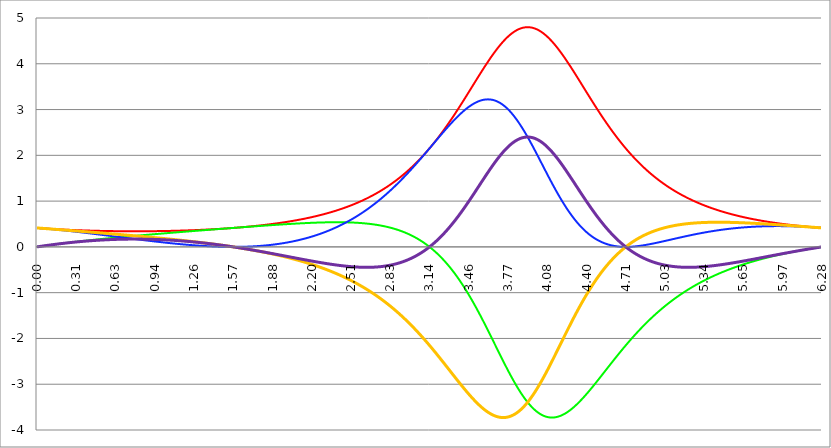
| Category | Series 1 | Series 0 | Series 2 | Series 3 | Series 4 |
|---|---|---|---|---|---|
| 0.0 | 0.414 | 0 | 0.414 | 0.414 | 0 |
| 0.00314159265358979 | 0.413 | 0.001 | 0.413 | 0.413 | 0.001 |
| 0.00628318530717958 | 0.413 | 0.003 | 0.413 | 0.413 | 0.003 |
| 0.00942477796076938 | 0.412 | 0.004 | 0.412 | 0.412 | 0.004 |
| 0.0125663706143592 | 0.412 | 0.005 | 0.411 | 0.411 | 0.005 |
| 0.015707963267949 | 0.411 | 0.006 | 0.411 | 0.411 | 0.006 |
| 0.0188495559215388 | 0.41 | 0.008 | 0.41 | 0.41 | 0.008 |
| 0.0219911485751285 | 0.41 | 0.009 | 0.409 | 0.41 | 0.009 |
| 0.0251327412287183 | 0.409 | 0.01 | 0.409 | 0.409 | 0.01 |
| 0.0282743338823081 | 0.408 | 0.012 | 0.408 | 0.408 | 0.012 |
| 0.0314159265358979 | 0.408 | 0.013 | 0.407 | 0.408 | 0.013 |
| 0.0345575191894877 | 0.407 | 0.014 | 0.407 | 0.407 | 0.014 |
| 0.0376991118430775 | 0.407 | 0.015 | 0.406 | 0.406 | 0.015 |
| 0.0408407044966673 | 0.406 | 0.017 | 0.405 | 0.406 | 0.017 |
| 0.0439822971502571 | 0.405 | 0.018 | 0.405 | 0.405 | 0.018 |
| 0.0471238898038469 | 0.405 | 0.019 | 0.404 | 0.404 | 0.019 |
| 0.0502654824574367 | 0.404 | 0.02 | 0.403 | 0.404 | 0.02 |
| 0.0534070751110265 | 0.404 | 0.022 | 0.402 | 0.403 | 0.022 |
| 0.0565486677646163 | 0.403 | 0.023 | 0.402 | 0.402 | 0.023 |
| 0.059690260418206 | 0.402 | 0.024 | 0.401 | 0.402 | 0.024 |
| 0.0628318530717958 | 0.402 | 0.025 | 0.4 | 0.401 | 0.025 |
| 0.0659734457253856 | 0.401 | 0.026 | 0.399 | 0.4 | 0.026 |
| 0.0691150383789754 | 0.401 | 0.028 | 0.399 | 0.4 | 0.028 |
| 0.0722566310325652 | 0.4 | 0.029 | 0.398 | 0.399 | 0.029 |
| 0.075398223686155 | 0.4 | 0.03 | 0.397 | 0.398 | 0.03 |
| 0.0785398163397448 | 0.399 | 0.031 | 0.397 | 0.398 | 0.031 |
| 0.0816814089933346 | 0.398 | 0.033 | 0.396 | 0.397 | 0.032 |
| 0.0848230016469244 | 0.398 | 0.034 | 0.395 | 0.396 | 0.034 |
| 0.0879645943005142 | 0.397 | 0.035 | 0.394 | 0.396 | 0.035 |
| 0.091106186954104 | 0.397 | 0.036 | 0.393 | 0.395 | 0.036 |
| 0.0942477796076937 | 0.396 | 0.037 | 0.393 | 0.394 | 0.037 |
| 0.0973893722612835 | 0.396 | 0.038 | 0.392 | 0.394 | 0.038 |
| 0.100530964914873 | 0.395 | 0.04 | 0.391 | 0.393 | 0.039 |
| 0.103672557568463 | 0.395 | 0.041 | 0.39 | 0.392 | 0.041 |
| 0.106814150222053 | 0.394 | 0.042 | 0.39 | 0.392 | 0.042 |
| 0.109955742875643 | 0.394 | 0.043 | 0.389 | 0.391 | 0.043 |
| 0.113097335529233 | 0.393 | 0.044 | 0.388 | 0.39 | 0.044 |
| 0.116238928182822 | 0.392 | 0.046 | 0.387 | 0.39 | 0.045 |
| 0.119380520836412 | 0.392 | 0.047 | 0.386 | 0.389 | 0.046 |
| 0.122522113490002 | 0.391 | 0.048 | 0.386 | 0.388 | 0.047 |
| 0.125663706143592 | 0.391 | 0.049 | 0.385 | 0.388 | 0.049 |
| 0.128805298797181 | 0.39 | 0.05 | 0.384 | 0.387 | 0.05 |
| 0.131946891450771 | 0.39 | 0.051 | 0.383 | 0.387 | 0.051 |
| 0.135088484104361 | 0.389 | 0.052 | 0.382 | 0.386 | 0.052 |
| 0.138230076757951 | 0.389 | 0.054 | 0.382 | 0.385 | 0.053 |
| 0.141371669411541 | 0.388 | 0.055 | 0.381 | 0.385 | 0.054 |
| 0.14451326206513 | 0.388 | 0.056 | 0.38 | 0.384 | 0.055 |
| 0.14765485471872 | 0.387 | 0.057 | 0.379 | 0.383 | 0.056 |
| 0.15079644737231 | 0.387 | 0.058 | 0.378 | 0.383 | 0.057 |
| 0.1539380400259 | 0.386 | 0.059 | 0.377 | 0.382 | 0.059 |
| 0.15707963267949 | 0.386 | 0.06 | 0.376 | 0.381 | 0.06 |
| 0.160221225333079 | 0.385 | 0.061 | 0.376 | 0.381 | 0.061 |
| 0.163362817986669 | 0.385 | 0.063 | 0.375 | 0.38 | 0.062 |
| 0.166504410640259 | 0.385 | 0.064 | 0.374 | 0.379 | 0.063 |
| 0.169646003293849 | 0.384 | 0.065 | 0.373 | 0.379 | 0.064 |
| 0.172787595947439 | 0.384 | 0.066 | 0.372 | 0.378 | 0.065 |
| 0.175929188601028 | 0.383 | 0.067 | 0.371 | 0.377 | 0.066 |
| 0.179070781254618 | 0.383 | 0.068 | 0.371 | 0.377 | 0.067 |
| 0.182212373908208 | 0.382 | 0.069 | 0.37 | 0.376 | 0.068 |
| 0.185353966561798 | 0.382 | 0.07 | 0.369 | 0.375 | 0.069 |
| 0.188495559215388 | 0.381 | 0.071 | 0.368 | 0.375 | 0.07 |
| 0.191637151868977 | 0.381 | 0.073 | 0.367 | 0.374 | 0.071 |
| 0.194778744522567 | 0.38 | 0.074 | 0.366 | 0.373 | 0.072 |
| 0.197920337176157 | 0.38 | 0.075 | 0.365 | 0.373 | 0.073 |
| 0.201061929829747 | 0.38 | 0.076 | 0.364 | 0.372 | 0.074 |
| 0.204203522483336 | 0.379 | 0.077 | 0.363 | 0.371 | 0.075 |
| 0.207345115136926 | 0.379 | 0.078 | 0.363 | 0.371 | 0.076 |
| 0.210486707790516 | 0.378 | 0.079 | 0.362 | 0.37 | 0.077 |
| 0.213628300444106 | 0.378 | 0.08 | 0.361 | 0.369 | 0.078 |
| 0.216769893097696 | 0.377 | 0.081 | 0.36 | 0.369 | 0.079 |
| 0.219911485751285 | 0.377 | 0.082 | 0.359 | 0.368 | 0.08 |
| 0.223053078404875 | 0.377 | 0.083 | 0.358 | 0.367 | 0.081 |
| 0.226194671058465 | 0.376 | 0.084 | 0.357 | 0.367 | 0.082 |
| 0.229336263712055 | 0.376 | 0.085 | 0.356 | 0.366 | 0.083 |
| 0.232477856365645 | 0.375 | 0.086 | 0.355 | 0.365 | 0.084 |
| 0.235619449019234 | 0.375 | 0.088 | 0.354 | 0.364 | 0.085 |
| 0.238761041672824 | 0.374 | 0.089 | 0.354 | 0.364 | 0.086 |
| 0.241902634326414 | 0.374 | 0.09 | 0.353 | 0.363 | 0.087 |
| 0.245044226980004 | 0.374 | 0.091 | 0.352 | 0.362 | 0.088 |
| 0.248185819633594 | 0.373 | 0.092 | 0.351 | 0.362 | 0.089 |
| 0.251327412287183 | 0.373 | 0.093 | 0.35 | 0.361 | 0.09 |
| 0.254469004940773 | 0.372 | 0.094 | 0.349 | 0.36 | 0.091 |
| 0.257610597594363 | 0.372 | 0.095 | 0.348 | 0.36 | 0.092 |
| 0.260752190247953 | 0.372 | 0.096 | 0.347 | 0.359 | 0.093 |
| 0.263893782901543 | 0.371 | 0.097 | 0.346 | 0.358 | 0.093 |
| 0.267035375555132 | 0.371 | 0.098 | 0.345 | 0.358 | 0.094 |
| 0.270176968208722 | 0.371 | 0.099 | 0.344 | 0.357 | 0.095 |
| 0.273318560862312 | 0.37 | 0.1 | 0.343 | 0.356 | 0.096 |
| 0.276460153515902 | 0.37 | 0.101 | 0.342 | 0.356 | 0.097 |
| 0.279601746169492 | 0.369 | 0.102 | 0.341 | 0.355 | 0.098 |
| 0.282743338823082 | 0.369 | 0.103 | 0.34 | 0.354 | 0.099 |
| 0.285884931476671 | 0.369 | 0.104 | 0.339 | 0.354 | 0.1 |
| 0.289026524130261 | 0.368 | 0.105 | 0.338 | 0.353 | 0.101 |
| 0.292168116783851 | 0.368 | 0.106 | 0.337 | 0.352 | 0.101 |
| 0.295309709437441 | 0.368 | 0.107 | 0.336 | 0.352 | 0.102 |
| 0.298451302091031 | 0.367 | 0.108 | 0.336 | 0.351 | 0.103 |
| 0.30159289474462 | 0.367 | 0.109 | 0.335 | 0.35 | 0.104 |
| 0.30473448739821 | 0.367 | 0.11 | 0.334 | 0.35 | 0.105 |
| 0.3078760800518 | 0.366 | 0.111 | 0.333 | 0.349 | 0.106 |
| 0.31101767270539 | 0.366 | 0.112 | 0.332 | 0.348 | 0.107 |
| 0.31415926535898 | 0.366 | 0.113 | 0.331 | 0.348 | 0.107 |
| 0.31730085801257 | 0.365 | 0.114 | 0.33 | 0.347 | 0.108 |
| 0.320442450666159 | 0.365 | 0.115 | 0.329 | 0.346 | 0.109 |
| 0.323584043319749 | 0.365 | 0.116 | 0.328 | 0.346 | 0.11 |
| 0.326725635973339 | 0.364 | 0.117 | 0.327 | 0.345 | 0.111 |
| 0.329867228626929 | 0.364 | 0.118 | 0.326 | 0.344 | 0.112 |
| 0.333008821280519 | 0.364 | 0.119 | 0.325 | 0.344 | 0.112 |
| 0.336150413934108 | 0.363 | 0.12 | 0.324 | 0.343 | 0.113 |
| 0.339292006587698 | 0.363 | 0.121 | 0.323 | 0.342 | 0.114 |
| 0.342433599241288 | 0.363 | 0.122 | 0.322 | 0.342 | 0.115 |
| 0.345575191894878 | 0.362 | 0.123 | 0.321 | 0.341 | 0.115 |
| 0.348716784548468 | 0.362 | 0.124 | 0.32 | 0.34 | 0.116 |
| 0.351858377202058 | 0.362 | 0.125 | 0.319 | 0.339 | 0.117 |
| 0.354999969855647 | 0.361 | 0.126 | 0.318 | 0.339 | 0.118 |
| 0.358141562509237 | 0.361 | 0.127 | 0.317 | 0.338 | 0.119 |
| 0.361283155162827 | 0.361 | 0.128 | 0.316 | 0.337 | 0.119 |
| 0.364424747816417 | 0.36 | 0.128 | 0.315 | 0.337 | 0.12 |
| 0.367566340470007 | 0.36 | 0.129 | 0.314 | 0.336 | 0.121 |
| 0.370707933123597 | 0.36 | 0.13 | 0.313 | 0.335 | 0.122 |
| 0.373849525777186 | 0.36 | 0.131 | 0.312 | 0.335 | 0.122 |
| 0.376991118430776 | 0.359 | 0.132 | 0.311 | 0.334 | 0.123 |
| 0.380132711084366 | 0.359 | 0.133 | 0.31 | 0.333 | 0.124 |
| 0.383274303737956 | 0.359 | 0.134 | 0.309 | 0.333 | 0.124 |
| 0.386415896391546 | 0.358 | 0.135 | 0.308 | 0.332 | 0.125 |
| 0.389557489045135 | 0.358 | 0.136 | 0.306 | 0.331 | 0.126 |
| 0.392699081698725 | 0.358 | 0.137 | 0.305 | 0.331 | 0.127 |
| 0.395840674352315 | 0.358 | 0.138 | 0.304 | 0.33 | 0.127 |
| 0.398982267005905 | 0.357 | 0.139 | 0.303 | 0.329 | 0.128 |
| 0.402123859659495 | 0.357 | 0.14 | 0.302 | 0.329 | 0.129 |
| 0.405265452313085 | 0.357 | 0.141 | 0.301 | 0.328 | 0.129 |
| 0.408407044966674 | 0.357 | 0.142 | 0.3 | 0.327 | 0.13 |
| 0.411548637620264 | 0.356 | 0.143 | 0.299 | 0.326 | 0.131 |
| 0.414690230273854 | 0.356 | 0.143 | 0.298 | 0.326 | 0.131 |
| 0.417831822927444 | 0.356 | 0.144 | 0.297 | 0.325 | 0.132 |
| 0.420973415581034 | 0.355 | 0.145 | 0.296 | 0.324 | 0.133 |
| 0.424115008234623 | 0.355 | 0.146 | 0.295 | 0.324 | 0.133 |
| 0.427256600888213 | 0.355 | 0.147 | 0.294 | 0.323 | 0.134 |
| 0.430398193541803 | 0.355 | 0.148 | 0.293 | 0.322 | 0.135 |
| 0.433539786195393 | 0.354 | 0.149 | 0.292 | 0.322 | 0.135 |
| 0.436681378848983 | 0.354 | 0.15 | 0.291 | 0.321 | 0.136 |
| 0.439822971502573 | 0.354 | 0.151 | 0.29 | 0.32 | 0.136 |
| 0.442964564156162 | 0.354 | 0.152 | 0.289 | 0.32 | 0.137 |
| 0.446106156809752 | 0.354 | 0.153 | 0.288 | 0.319 | 0.138 |
| 0.449247749463342 | 0.353 | 0.153 | 0.287 | 0.318 | 0.138 |
| 0.452389342116932 | 0.353 | 0.154 | 0.286 | 0.318 | 0.139 |
| 0.455530934770522 | 0.353 | 0.155 | 0.285 | 0.317 | 0.139 |
| 0.458672527424111 | 0.353 | 0.156 | 0.283 | 0.316 | 0.14 |
| 0.461814120077701 | 0.352 | 0.157 | 0.282 | 0.315 | 0.141 |
| 0.464955712731291 | 0.352 | 0.158 | 0.281 | 0.315 | 0.141 |
| 0.468097305384881 | 0.352 | 0.159 | 0.28 | 0.314 | 0.142 |
| 0.471238898038471 | 0.352 | 0.16 | 0.279 | 0.313 | 0.142 |
| 0.474380490692061 | 0.351 | 0.161 | 0.278 | 0.313 | 0.143 |
| 0.47752208334565 | 0.351 | 0.161 | 0.277 | 0.312 | 0.143 |
| 0.48066367599924 | 0.351 | 0.162 | 0.276 | 0.311 | 0.144 |
| 0.48380526865283 | 0.351 | 0.163 | 0.275 | 0.311 | 0.144 |
| 0.48694686130642 | 0.351 | 0.164 | 0.274 | 0.31 | 0.145 |
| 0.49008845396001 | 0.35 | 0.165 | 0.273 | 0.309 | 0.146 |
| 0.493230046613599 | 0.35 | 0.166 | 0.272 | 0.308 | 0.146 |
| 0.496371639267189 | 0.35 | 0.167 | 0.271 | 0.308 | 0.147 |
| 0.499513231920779 | 0.35 | 0.168 | 0.27 | 0.307 | 0.147 |
| 0.502654824574369 | 0.35 | 0.168 | 0.269 | 0.306 | 0.148 |
| 0.505796417227959 | 0.349 | 0.169 | 0.267 | 0.306 | 0.148 |
| 0.508938009881549 | 0.349 | 0.17 | 0.266 | 0.305 | 0.149 |
| 0.512079602535138 | 0.349 | 0.171 | 0.265 | 0.304 | 0.149 |
| 0.515221195188728 | 0.349 | 0.172 | 0.264 | 0.304 | 0.15 |
| 0.518362787842318 | 0.349 | 0.173 | 0.263 | 0.303 | 0.15 |
| 0.521504380495908 | 0.349 | 0.174 | 0.262 | 0.302 | 0.151 |
| 0.524645973149498 | 0.348 | 0.174 | 0.261 | 0.302 | 0.151 |
| 0.527787565803087 | 0.348 | 0.175 | 0.26 | 0.301 | 0.151 |
| 0.530929158456677 | 0.348 | 0.176 | 0.259 | 0.3 | 0.152 |
| 0.534070751110267 | 0.348 | 0.177 | 0.258 | 0.299 | 0.152 |
| 0.537212343763857 | 0.348 | 0.178 | 0.257 | 0.299 | 0.153 |
| 0.540353936417447 | 0.347 | 0.179 | 0.256 | 0.298 | 0.153 |
| 0.543495529071037 | 0.347 | 0.18 | 0.254 | 0.297 | 0.154 |
| 0.546637121724626 | 0.347 | 0.18 | 0.253 | 0.297 | 0.154 |
| 0.549778714378216 | 0.347 | 0.181 | 0.252 | 0.296 | 0.155 |
| 0.552920307031806 | 0.347 | 0.182 | 0.251 | 0.295 | 0.155 |
| 0.556061899685396 | 0.347 | 0.183 | 0.25 | 0.294 | 0.155 |
| 0.559203492338986 | 0.347 | 0.184 | 0.249 | 0.294 | 0.156 |
| 0.562345084992576 | 0.346 | 0.185 | 0.248 | 0.293 | 0.156 |
| 0.565486677646165 | 0.346 | 0.186 | 0.247 | 0.292 | 0.157 |
| 0.568628270299755 | 0.346 | 0.186 | 0.246 | 0.292 | 0.157 |
| 0.571769862953345 | 0.346 | 0.187 | 0.245 | 0.291 | 0.157 |
| 0.574911455606935 | 0.346 | 0.188 | 0.244 | 0.29 | 0.158 |
| 0.578053048260525 | 0.346 | 0.189 | 0.242 | 0.289 | 0.158 |
| 0.581194640914114 | 0.346 | 0.19 | 0.241 | 0.289 | 0.159 |
| 0.584336233567704 | 0.345 | 0.191 | 0.24 | 0.288 | 0.159 |
| 0.587477826221294 | 0.345 | 0.191 | 0.239 | 0.287 | 0.159 |
| 0.590619418874884 | 0.345 | 0.192 | 0.238 | 0.287 | 0.16 |
| 0.593761011528474 | 0.345 | 0.193 | 0.237 | 0.286 | 0.16 |
| 0.596902604182064 | 0.345 | 0.194 | 0.236 | 0.285 | 0.16 |
| 0.600044196835653 | 0.345 | 0.195 | 0.235 | 0.285 | 0.161 |
| 0.603185789489243 | 0.345 | 0.195 | 0.234 | 0.284 | 0.161 |
| 0.606327382142833 | 0.344 | 0.196 | 0.233 | 0.283 | 0.161 |
| 0.609468974796423 | 0.344 | 0.197 | 0.232 | 0.282 | 0.162 |
| 0.612610567450013 | 0.344 | 0.198 | 0.23 | 0.282 | 0.162 |
| 0.615752160103602 | 0.344 | 0.199 | 0.229 | 0.281 | 0.162 |
| 0.618893752757192 | 0.344 | 0.2 | 0.228 | 0.28 | 0.163 |
| 0.622035345410782 | 0.344 | 0.2 | 0.227 | 0.279 | 0.163 |
| 0.625176938064372 | 0.344 | 0.201 | 0.226 | 0.279 | 0.163 |
| 0.628318530717962 | 0.344 | 0.202 | 0.225 | 0.278 | 0.163 |
| 0.631460123371551 | 0.344 | 0.203 | 0.224 | 0.277 | 0.164 |
| 0.634601716025141 | 0.343 | 0.204 | 0.223 | 0.277 | 0.164 |
| 0.637743308678731 | 0.343 | 0.204 | 0.222 | 0.276 | 0.164 |
| 0.640884901332321 | 0.343 | 0.205 | 0.221 | 0.275 | 0.165 |
| 0.644026493985911 | 0.343 | 0.206 | 0.219 | 0.274 | 0.165 |
| 0.647168086639501 | 0.343 | 0.207 | 0.218 | 0.274 | 0.165 |
| 0.65030967929309 | 0.343 | 0.208 | 0.217 | 0.273 | 0.165 |
| 0.65345127194668 | 0.343 | 0.208 | 0.216 | 0.272 | 0.166 |
| 0.65659286460027 | 0.343 | 0.209 | 0.215 | 0.272 | 0.166 |
| 0.65973445725386 | 0.343 | 0.21 | 0.214 | 0.271 | 0.166 |
| 0.66287604990745 | 0.343 | 0.211 | 0.213 | 0.27 | 0.166 |
| 0.666017642561039 | 0.343 | 0.212 | 0.212 | 0.269 | 0.166 |
| 0.669159235214629 | 0.342 | 0.212 | 0.211 | 0.269 | 0.167 |
| 0.672300827868219 | 0.342 | 0.213 | 0.21 | 0.268 | 0.167 |
| 0.675442420521809 | 0.342 | 0.214 | 0.209 | 0.267 | 0.167 |
| 0.678584013175399 | 0.342 | 0.215 | 0.207 | 0.266 | 0.167 |
| 0.681725605828989 | 0.342 | 0.216 | 0.206 | 0.266 | 0.167 |
| 0.684867198482578 | 0.342 | 0.216 | 0.205 | 0.265 | 0.168 |
| 0.688008791136168 | 0.342 | 0.217 | 0.204 | 0.264 | 0.168 |
| 0.691150383789758 | 0.342 | 0.218 | 0.203 | 0.264 | 0.168 |
| 0.694291976443348 | 0.342 | 0.219 | 0.202 | 0.263 | 0.168 |
| 0.697433569096938 | 0.342 | 0.22 | 0.201 | 0.262 | 0.168 |
| 0.700575161750528 | 0.342 | 0.22 | 0.2 | 0.261 | 0.168 |
| 0.703716754404117 | 0.342 | 0.221 | 0.199 | 0.261 | 0.169 |
| 0.706858347057707 | 0.342 | 0.222 | 0.198 | 0.26 | 0.169 |
| 0.709999939711297 | 0.342 | 0.223 | 0.196 | 0.259 | 0.169 |
| 0.713141532364887 | 0.342 | 0.223 | 0.195 | 0.258 | 0.169 |
| 0.716283125018477 | 0.342 | 0.224 | 0.194 | 0.258 | 0.169 |
| 0.719424717672066 | 0.342 | 0.225 | 0.193 | 0.257 | 0.169 |
| 0.722566310325656 | 0.341 | 0.226 | 0.192 | 0.256 | 0.169 |
| 0.725707902979246 | 0.341 | 0.227 | 0.191 | 0.255 | 0.17 |
| 0.728849495632836 | 0.341 | 0.227 | 0.19 | 0.255 | 0.17 |
| 0.731991088286426 | 0.341 | 0.228 | 0.189 | 0.254 | 0.17 |
| 0.735132680940016 | 0.341 | 0.229 | 0.188 | 0.253 | 0.17 |
| 0.738274273593605 | 0.341 | 0.23 | 0.187 | 0.252 | 0.17 |
| 0.741415866247195 | 0.341 | 0.23 | 0.186 | 0.252 | 0.17 |
| 0.744557458900785 | 0.341 | 0.231 | 0.185 | 0.251 | 0.17 |
| 0.747699051554375 | 0.341 | 0.232 | 0.183 | 0.25 | 0.17 |
| 0.750840644207965 | 0.341 | 0.233 | 0.182 | 0.249 | 0.17 |
| 0.753982236861554 | 0.341 | 0.234 | 0.181 | 0.249 | 0.17 |
| 0.757123829515144 | 0.341 | 0.234 | 0.18 | 0.248 | 0.17 |
| 0.760265422168734 | 0.341 | 0.235 | 0.179 | 0.247 | 0.17 |
| 0.763407014822324 | 0.341 | 0.236 | 0.178 | 0.246 | 0.17 |
| 0.766548607475914 | 0.341 | 0.237 | 0.177 | 0.246 | 0.17 |
| 0.769690200129504 | 0.341 | 0.237 | 0.176 | 0.245 | 0.17 |
| 0.772831792783093 | 0.341 | 0.238 | 0.175 | 0.244 | 0.17 |
| 0.775973385436683 | 0.341 | 0.239 | 0.174 | 0.243 | 0.171 |
| 0.779114978090273 | 0.341 | 0.24 | 0.173 | 0.243 | 0.171 |
| 0.782256570743863 | 0.341 | 0.24 | 0.172 | 0.242 | 0.171 |
| 0.785398163397453 | 0.341 | 0.241 | 0.171 | 0.241 | 0.171 |
| 0.788539756051042 | 0.341 | 0.242 | 0.169 | 0.24 | 0.171 |
| 0.791681348704632 | 0.341 | 0.243 | 0.168 | 0.24 | 0.171 |
| 0.794822941358222 | 0.341 | 0.243 | 0.167 | 0.239 | 0.171 |
| 0.797964534011812 | 0.341 | 0.244 | 0.166 | 0.238 | 0.17 |
| 0.801106126665402 | 0.341 | 0.245 | 0.165 | 0.237 | 0.17 |
| 0.804247719318992 | 0.341 | 0.246 | 0.164 | 0.237 | 0.17 |
| 0.807389311972581 | 0.341 | 0.246 | 0.163 | 0.236 | 0.17 |
| 0.810530904626171 | 0.341 | 0.247 | 0.162 | 0.235 | 0.17 |
| 0.813672497279761 | 0.341 | 0.248 | 0.161 | 0.234 | 0.17 |
| 0.816814089933351 | 0.341 | 0.249 | 0.16 | 0.234 | 0.17 |
| 0.819955682586941 | 0.341 | 0.249 | 0.159 | 0.233 | 0.17 |
| 0.823097275240531 | 0.341 | 0.25 | 0.158 | 0.232 | 0.17 |
| 0.82623886789412 | 0.341 | 0.251 | 0.157 | 0.231 | 0.17 |
| 0.82938046054771 | 0.341 | 0.252 | 0.156 | 0.23 | 0.17 |
| 0.8325220532013 | 0.341 | 0.252 | 0.155 | 0.23 | 0.17 |
| 0.83566364585489 | 0.341 | 0.253 | 0.154 | 0.229 | 0.17 |
| 0.83880523850848 | 0.341 | 0.254 | 0.152 | 0.228 | 0.17 |
| 0.841946831162069 | 0.341 | 0.255 | 0.151 | 0.227 | 0.17 |
| 0.845088423815659 | 0.341 | 0.255 | 0.15 | 0.227 | 0.17 |
| 0.848230016469249 | 0.341 | 0.256 | 0.149 | 0.226 | 0.169 |
| 0.851371609122839 | 0.342 | 0.257 | 0.148 | 0.225 | 0.169 |
| 0.854513201776429 | 0.342 | 0.258 | 0.147 | 0.224 | 0.169 |
| 0.857654794430019 | 0.342 | 0.258 | 0.146 | 0.223 | 0.169 |
| 0.860796387083608 | 0.342 | 0.259 | 0.145 | 0.223 | 0.169 |
| 0.863937979737198 | 0.342 | 0.26 | 0.144 | 0.222 | 0.169 |
| 0.867079572390788 | 0.342 | 0.261 | 0.143 | 0.221 | 0.169 |
| 0.870221165044378 | 0.342 | 0.261 | 0.142 | 0.22 | 0.168 |
| 0.873362757697968 | 0.342 | 0.262 | 0.141 | 0.22 | 0.168 |
| 0.876504350351557 | 0.342 | 0.263 | 0.14 | 0.219 | 0.168 |
| 0.879645943005147 | 0.342 | 0.264 | 0.139 | 0.218 | 0.168 |
| 0.882787535658737 | 0.342 | 0.264 | 0.138 | 0.217 | 0.168 |
| 0.885929128312327 | 0.342 | 0.265 | 0.137 | 0.216 | 0.168 |
| 0.889070720965917 | 0.342 | 0.266 | 0.136 | 0.216 | 0.167 |
| 0.892212313619507 | 0.342 | 0.266 | 0.135 | 0.215 | 0.167 |
| 0.895353906273096 | 0.342 | 0.267 | 0.134 | 0.214 | 0.167 |
| 0.898495498926686 | 0.342 | 0.268 | 0.133 | 0.213 | 0.167 |
| 0.901637091580276 | 0.342 | 0.269 | 0.132 | 0.212 | 0.167 |
| 0.904778684233866 | 0.343 | 0.269 | 0.131 | 0.212 | 0.166 |
| 0.907920276887456 | 0.343 | 0.27 | 0.13 | 0.211 | 0.166 |
| 0.911061869541045 | 0.343 | 0.271 | 0.129 | 0.21 | 0.166 |
| 0.914203462194635 | 0.343 | 0.272 | 0.128 | 0.209 | 0.166 |
| 0.917345054848225 | 0.343 | 0.272 | 0.127 | 0.208 | 0.166 |
| 0.920486647501815 | 0.343 | 0.273 | 0.126 | 0.208 | 0.165 |
| 0.923628240155405 | 0.343 | 0.274 | 0.125 | 0.207 | 0.165 |
| 0.926769832808995 | 0.343 | 0.274 | 0.124 | 0.206 | 0.165 |
| 0.929911425462584 | 0.343 | 0.275 | 0.123 | 0.205 | 0.165 |
| 0.933053018116174 | 0.343 | 0.276 | 0.122 | 0.204 | 0.164 |
| 0.936194610769764 | 0.343 | 0.277 | 0.121 | 0.204 | 0.164 |
| 0.939336203423354 | 0.344 | 0.277 | 0.12 | 0.203 | 0.164 |
| 0.942477796076944 | 0.344 | 0.278 | 0.119 | 0.202 | 0.163 |
| 0.945619388730533 | 0.344 | 0.279 | 0.118 | 0.201 | 0.163 |
| 0.948760981384123 | 0.344 | 0.279 | 0.117 | 0.2 | 0.163 |
| 0.951902574037713 | 0.344 | 0.28 | 0.116 | 0.2 | 0.163 |
| 0.955044166691303 | 0.344 | 0.281 | 0.115 | 0.199 | 0.162 |
| 0.958185759344893 | 0.344 | 0.282 | 0.114 | 0.198 | 0.162 |
| 0.961327351998483 | 0.344 | 0.282 | 0.113 | 0.197 | 0.162 |
| 0.964468944652072 | 0.344 | 0.283 | 0.112 | 0.196 | 0.161 |
| 0.967610537305662 | 0.345 | 0.284 | 0.111 | 0.195 | 0.161 |
| 0.970752129959252 | 0.345 | 0.285 | 0.11 | 0.195 | 0.161 |
| 0.973893722612842 | 0.345 | 0.285 | 0.109 | 0.194 | 0.16 |
| 0.977035315266432 | 0.345 | 0.286 | 0.108 | 0.193 | 0.16 |
| 0.980176907920022 | 0.345 | 0.287 | 0.107 | 0.192 | 0.16 |
| 0.983318500573611 | 0.345 | 0.287 | 0.106 | 0.191 | 0.159 |
| 0.986460093227201 | 0.345 | 0.288 | 0.105 | 0.191 | 0.159 |
| 0.989601685880791 | 0.346 | 0.289 | 0.104 | 0.19 | 0.159 |
| 0.992743278534381 | 0.346 | 0.289 | 0.103 | 0.189 | 0.158 |
| 0.995884871187971 | 0.346 | 0.29 | 0.102 | 0.188 | 0.158 |
| 0.99902646384156 | 0.346 | 0.291 | 0.101 | 0.187 | 0.157 |
| 1.00216805649515 | 0.346 | 0.292 | 0.1 | 0.186 | 0.157 |
| 1.00530964914874 | 0.346 | 0.292 | 0.099 | 0.186 | 0.157 |
| 1.00845124180233 | 0.346 | 0.293 | 0.098 | 0.185 | 0.156 |
| 1.01159283445592 | 0.347 | 0.294 | 0.098 | 0.184 | 0.156 |
| 1.01473442710951 | 0.347 | 0.294 | 0.097 | 0.183 | 0.155 |
| 1.017876019763099 | 0.347 | 0.295 | 0.096 | 0.182 | 0.155 |
| 1.021017612416689 | 0.347 | 0.296 | 0.095 | 0.181 | 0.155 |
| 1.02415920507028 | 0.347 | 0.297 | 0.094 | 0.18 | 0.154 |
| 1.027300797723869 | 0.347 | 0.297 | 0.093 | 0.18 | 0.154 |
| 1.030442390377459 | 0.347 | 0.298 | 0.092 | 0.179 | 0.153 |
| 1.033583983031048 | 0.348 | 0.299 | 0.091 | 0.178 | 0.153 |
| 1.036725575684638 | 0.348 | 0.299 | 0.09 | 0.177 | 0.152 |
| 1.039867168338228 | 0.348 | 0.3 | 0.089 | 0.176 | 0.152 |
| 1.043008760991818 | 0.348 | 0.301 | 0.088 | 0.175 | 0.151 |
| 1.046150353645408 | 0.348 | 0.302 | 0.087 | 0.174 | 0.151 |
| 1.049291946298998 | 0.349 | 0.302 | 0.087 | 0.174 | 0.151 |
| 1.052433538952587 | 0.349 | 0.303 | 0.086 | 0.173 | 0.15 |
| 1.055575131606177 | 0.349 | 0.304 | 0.085 | 0.172 | 0.15 |
| 1.058716724259767 | 0.349 | 0.304 | 0.084 | 0.171 | 0.149 |
| 1.061858316913357 | 0.349 | 0.305 | 0.083 | 0.17 | 0.149 |
| 1.064999909566947 | 0.349 | 0.306 | 0.082 | 0.169 | 0.148 |
| 1.068141502220536 | 0.35 | 0.306 | 0.081 | 0.168 | 0.148 |
| 1.071283094874126 | 0.35 | 0.307 | 0.08 | 0.168 | 0.147 |
| 1.074424687527716 | 0.35 | 0.308 | 0.079 | 0.167 | 0.147 |
| 1.077566280181306 | 0.35 | 0.308 | 0.079 | 0.166 | 0.146 |
| 1.080707872834896 | 0.35 | 0.309 | 0.078 | 0.165 | 0.146 |
| 1.083849465488486 | 0.351 | 0.31 | 0.077 | 0.164 | 0.145 |
| 1.086991058142075 | 0.351 | 0.311 | 0.076 | 0.163 | 0.144 |
| 1.090132650795665 | 0.351 | 0.311 | 0.075 | 0.162 | 0.144 |
| 1.093274243449255 | 0.351 | 0.312 | 0.074 | 0.161 | 0.143 |
| 1.096415836102845 | 0.351 | 0.313 | 0.073 | 0.161 | 0.143 |
| 1.099557428756435 | 0.352 | 0.313 | 0.072 | 0.16 | 0.142 |
| 1.102699021410025 | 0.352 | 0.314 | 0.072 | 0.159 | 0.142 |
| 1.105840614063614 | 0.352 | 0.315 | 0.071 | 0.158 | 0.141 |
| 1.108982206717204 | 0.352 | 0.315 | 0.07 | 0.157 | 0.141 |
| 1.112123799370794 | 0.353 | 0.316 | 0.069 | 0.156 | 0.14 |
| 1.115265392024384 | 0.353 | 0.317 | 0.068 | 0.155 | 0.139 |
| 1.118406984677974 | 0.353 | 0.318 | 0.067 | 0.154 | 0.139 |
| 1.121548577331563 | 0.353 | 0.318 | 0.067 | 0.153 | 0.138 |
| 1.124690169985153 | 0.354 | 0.319 | 0.066 | 0.153 | 0.138 |
| 1.127831762638743 | 0.354 | 0.32 | 0.065 | 0.152 | 0.137 |
| 1.130973355292333 | 0.354 | 0.32 | 0.064 | 0.151 | 0.136 |
| 1.134114947945923 | 0.354 | 0.321 | 0.063 | 0.15 | 0.136 |
| 1.137256540599513 | 0.354 | 0.322 | 0.063 | 0.149 | 0.135 |
| 1.140398133253102 | 0.355 | 0.322 | 0.062 | 0.148 | 0.135 |
| 1.143539725906692 | 0.355 | 0.323 | 0.061 | 0.147 | 0.134 |
| 1.146681318560282 | 0.355 | 0.324 | 0.06 | 0.146 | 0.133 |
| 1.149822911213872 | 0.355 | 0.324 | 0.059 | 0.145 | 0.133 |
| 1.152964503867462 | 0.356 | 0.325 | 0.059 | 0.144 | 0.132 |
| 1.156106096521051 | 0.356 | 0.326 | 0.058 | 0.143 | 0.131 |
| 1.159247689174641 | 0.356 | 0.326 | 0.057 | 0.143 | 0.131 |
| 1.162389281828231 | 0.357 | 0.327 | 0.056 | 0.142 | 0.13 |
| 1.165530874481821 | 0.357 | 0.328 | 0.055 | 0.141 | 0.129 |
| 1.168672467135411 | 0.357 | 0.329 | 0.055 | 0.14 | 0.129 |
| 1.171814059789001 | 0.357 | 0.329 | 0.054 | 0.139 | 0.128 |
| 1.17495565244259 | 0.358 | 0.33 | 0.053 | 0.138 | 0.127 |
| 1.17809724509618 | 0.358 | 0.331 | 0.052 | 0.137 | 0.127 |
| 1.18123883774977 | 0.358 | 0.331 | 0.052 | 0.136 | 0.126 |
| 1.18438043040336 | 0.358 | 0.332 | 0.051 | 0.135 | 0.125 |
| 1.18752202305695 | 0.359 | 0.333 | 0.05 | 0.134 | 0.124 |
| 1.190663615710539 | 0.359 | 0.333 | 0.049 | 0.133 | 0.124 |
| 1.193805208364129 | 0.359 | 0.334 | 0.049 | 0.132 | 0.123 |
| 1.19694680101772 | 0.36 | 0.335 | 0.048 | 0.131 | 0.122 |
| 1.200088393671309 | 0.36 | 0.335 | 0.047 | 0.13 | 0.122 |
| 1.203229986324899 | 0.36 | 0.336 | 0.047 | 0.129 | 0.121 |
| 1.206371578978489 | 0.36 | 0.337 | 0.046 | 0.128 | 0.12 |
| 1.209513171632078 | 0.361 | 0.337 | 0.045 | 0.128 | 0.119 |
| 1.212654764285668 | 0.361 | 0.338 | 0.044 | 0.127 | 0.119 |
| 1.215796356939258 | 0.361 | 0.339 | 0.044 | 0.126 | 0.118 |
| 1.218937949592848 | 0.362 | 0.339 | 0.043 | 0.125 | 0.117 |
| 1.222079542246438 | 0.362 | 0.34 | 0.042 | 0.124 | 0.116 |
| 1.225221134900027 | 0.362 | 0.341 | 0.042 | 0.123 | 0.115 |
| 1.228362727553617 | 0.363 | 0.342 | 0.041 | 0.122 | 0.115 |
| 1.231504320207207 | 0.363 | 0.342 | 0.04 | 0.121 | 0.114 |
| 1.234645912860797 | 0.363 | 0.343 | 0.04 | 0.12 | 0.113 |
| 1.237787505514387 | 0.364 | 0.344 | 0.039 | 0.119 | 0.112 |
| 1.240929098167977 | 0.364 | 0.344 | 0.038 | 0.118 | 0.112 |
| 1.244070690821566 | 0.364 | 0.345 | 0.038 | 0.117 | 0.111 |
| 1.247212283475156 | 0.365 | 0.346 | 0.037 | 0.116 | 0.11 |
| 1.250353876128746 | 0.365 | 0.346 | 0.036 | 0.115 | 0.109 |
| 1.253495468782336 | 0.365 | 0.347 | 0.036 | 0.114 | 0.108 |
| 1.256637061435926 | 0.366 | 0.348 | 0.035 | 0.113 | 0.107 |
| 1.259778654089515 | 0.366 | 0.348 | 0.034 | 0.112 | 0.107 |
| 1.262920246743105 | 0.366 | 0.349 | 0.034 | 0.111 | 0.106 |
| 1.266061839396695 | 0.367 | 0.35 | 0.033 | 0.11 | 0.105 |
| 1.269203432050285 | 0.367 | 0.35 | 0.032 | 0.109 | 0.104 |
| 1.272345024703875 | 0.367 | 0.351 | 0.032 | 0.108 | 0.103 |
| 1.275486617357465 | 0.368 | 0.352 | 0.031 | 0.107 | 0.102 |
| 1.278628210011054 | 0.368 | 0.352 | 0.031 | 0.106 | 0.101 |
| 1.281769802664644 | 0.368 | 0.353 | 0.03 | 0.105 | 0.101 |
| 1.284911395318234 | 0.369 | 0.354 | 0.029 | 0.104 | 0.1 |
| 1.288052987971824 | 0.369 | 0.354 | 0.029 | 0.103 | 0.099 |
| 1.291194580625414 | 0.369 | 0.355 | 0.028 | 0.102 | 0.098 |
| 1.294336173279003 | 0.37 | 0.356 | 0.028 | 0.101 | 0.097 |
| 1.297477765932593 | 0.37 | 0.356 | 0.027 | 0.1 | 0.096 |
| 1.300619358586183 | 0.371 | 0.357 | 0.026 | 0.099 | 0.095 |
| 1.303760951239773 | 0.371 | 0.358 | 0.026 | 0.098 | 0.094 |
| 1.306902543893363 | 0.371 | 0.358 | 0.025 | 0.097 | 0.093 |
| 1.310044136546953 | 0.372 | 0.359 | 0.025 | 0.096 | 0.093 |
| 1.313185729200542 | 0.372 | 0.36 | 0.024 | 0.095 | 0.092 |
| 1.316327321854132 | 0.372 | 0.36 | 0.024 | 0.094 | 0.091 |
| 1.319468914507722 | 0.373 | 0.361 | 0.023 | 0.093 | 0.09 |
| 1.322610507161312 | 0.373 | 0.362 | 0.023 | 0.092 | 0.089 |
| 1.325752099814902 | 0.374 | 0.362 | 0.022 | 0.091 | 0.088 |
| 1.328893692468491 | 0.374 | 0.363 | 0.021 | 0.09 | 0.087 |
| 1.332035285122081 | 0.374 | 0.364 | 0.021 | 0.089 | 0.086 |
| 1.335176877775671 | 0.375 | 0.364 | 0.02 | 0.088 | 0.085 |
| 1.338318470429261 | 0.375 | 0.365 | 0.02 | 0.086 | 0.084 |
| 1.341460063082851 | 0.376 | 0.366 | 0.019 | 0.085 | 0.083 |
| 1.344601655736441 | 0.376 | 0.367 | 0.019 | 0.084 | 0.082 |
| 1.34774324839003 | 0.377 | 0.367 | 0.018 | 0.083 | 0.081 |
| 1.35088484104362 | 0.377 | 0.368 | 0.018 | 0.082 | 0.08 |
| 1.35402643369721 | 0.377 | 0.369 | 0.017 | 0.081 | 0.079 |
| 1.3571680263508 | 0.378 | 0.369 | 0.017 | 0.08 | 0.078 |
| 1.36030961900439 | 0.378 | 0.37 | 0.017 | 0.079 | 0.077 |
| 1.363451211657979 | 0.379 | 0.371 | 0.016 | 0.078 | 0.076 |
| 1.36659280431157 | 0.379 | 0.371 | 0.016 | 0.077 | 0.075 |
| 1.369734396965159 | 0.38 | 0.372 | 0.015 | 0.076 | 0.074 |
| 1.372875989618749 | 0.38 | 0.373 | 0.015 | 0.075 | 0.073 |
| 1.376017582272339 | 0.38 | 0.373 | 0.014 | 0.074 | 0.072 |
| 1.379159174925929 | 0.381 | 0.374 | 0.014 | 0.073 | 0.071 |
| 1.382300767579518 | 0.381 | 0.375 | 0.013 | 0.071 | 0.07 |
| 1.385442360233108 | 0.382 | 0.375 | 0.013 | 0.07 | 0.069 |
| 1.388583952886698 | 0.382 | 0.376 | 0.013 | 0.069 | 0.068 |
| 1.391725545540288 | 0.383 | 0.377 | 0.012 | 0.068 | 0.067 |
| 1.394867138193878 | 0.383 | 0.377 | 0.012 | 0.067 | 0.066 |
| 1.398008730847468 | 0.384 | 0.378 | 0.011 | 0.066 | 0.065 |
| 1.401150323501057 | 0.384 | 0.379 | 0.011 | 0.065 | 0.064 |
| 1.404291916154647 | 0.385 | 0.379 | 0.011 | 0.064 | 0.063 |
| 1.407433508808237 | 0.385 | 0.38 | 0.01 | 0.063 | 0.062 |
| 1.410575101461827 | 0.385 | 0.381 | 0.01 | 0.061 | 0.061 |
| 1.413716694115417 | 0.386 | 0.381 | 0.009 | 0.06 | 0.06 |
| 1.416858286769006 | 0.386 | 0.382 | 0.009 | 0.059 | 0.059 |
| 1.419999879422596 | 0.387 | 0.383 | 0.009 | 0.058 | 0.057 |
| 1.423141472076186 | 0.387 | 0.383 | 0.008 | 0.057 | 0.056 |
| 1.426283064729776 | 0.388 | 0.384 | 0.008 | 0.056 | 0.055 |
| 1.429424657383366 | 0.388 | 0.385 | 0.008 | 0.055 | 0.054 |
| 1.432566250036956 | 0.389 | 0.385 | 0.007 | 0.054 | 0.053 |
| 1.435707842690545 | 0.389 | 0.386 | 0.007 | 0.052 | 0.052 |
| 1.438849435344135 | 0.39 | 0.387 | 0.007 | 0.051 | 0.051 |
| 1.441991027997725 | 0.39 | 0.387 | 0.006 | 0.05 | 0.05 |
| 1.445132620651315 | 0.391 | 0.388 | 0.006 | 0.049 | 0.049 |
| 1.448274213304905 | 0.391 | 0.388 | 0.006 | 0.048 | 0.047 |
| 1.451415805958494 | 0.392 | 0.389 | 0.006 | 0.047 | 0.046 |
| 1.454557398612084 | 0.392 | 0.39 | 0.005 | 0.046 | 0.045 |
| 1.457698991265674 | 0.393 | 0.39 | 0.005 | 0.044 | 0.044 |
| 1.460840583919264 | 0.394 | 0.391 | 0.005 | 0.043 | 0.043 |
| 1.463982176572854 | 0.394 | 0.392 | 0.004 | 0.042 | 0.042 |
| 1.467123769226444 | 0.395 | 0.392 | 0.004 | 0.041 | 0.041 |
| 1.470265361880033 | 0.395 | 0.393 | 0.004 | 0.04 | 0.039 |
| 1.473406954533623 | 0.396 | 0.394 | 0.004 | 0.038 | 0.038 |
| 1.476548547187213 | 0.396 | 0.394 | 0.004 | 0.037 | 0.037 |
| 1.479690139840803 | 0.397 | 0.395 | 0.003 | 0.036 | 0.036 |
| 1.482831732494393 | 0.397 | 0.396 | 0.003 | 0.035 | 0.035 |
| 1.485973325147982 | 0.398 | 0.396 | 0.003 | 0.034 | 0.034 |
| 1.489114917801572 | 0.398 | 0.397 | 0.003 | 0.033 | 0.032 |
| 1.492256510455162 | 0.399 | 0.398 | 0.002 | 0.031 | 0.031 |
| 1.495398103108752 | 0.4 | 0.398 | 0.002 | 0.03 | 0.03 |
| 1.498539695762342 | 0.4 | 0.399 | 0.002 | 0.029 | 0.029 |
| 1.501681288415932 | 0.401 | 0.4 | 0.002 | 0.028 | 0.028 |
| 1.504822881069521 | 0.401 | 0.4 | 0.002 | 0.026 | 0.026 |
| 1.507964473723111 | 0.402 | 0.401 | 0.002 | 0.025 | 0.025 |
| 1.511106066376701 | 0.402 | 0.402 | 0.001 | 0.024 | 0.024 |
| 1.514247659030291 | 0.403 | 0.402 | 0.001 | 0.023 | 0.023 |
| 1.517389251683881 | 0.404 | 0.403 | 0.001 | 0.022 | 0.022 |
| 1.520530844337471 | 0.404 | 0.404 | 0.001 | 0.02 | 0.02 |
| 1.52367243699106 | 0.405 | 0.404 | 0.001 | 0.019 | 0.019 |
| 1.52681402964465 | 0.405 | 0.405 | 0.001 | 0.018 | 0.018 |
| 1.52995562229824 | 0.406 | 0.406 | 0.001 | 0.017 | 0.017 |
| 1.53309721495183 | 0.407 | 0.406 | 0.001 | 0.015 | 0.015 |
| 1.53623880760542 | 0.407 | 0.407 | 0 | 0.014 | 0.014 |
| 1.539380400259009 | 0.408 | 0.408 | 0 | 0.013 | 0.013 |
| 1.542521992912599 | 0.408 | 0.408 | 0 | 0.012 | 0.012 |
| 1.545663585566189 | 0.409 | 0.409 | 0 | 0.01 | 0.01 |
| 1.548805178219779 | 0.41 | 0.41 | 0 | 0.009 | 0.009 |
| 1.551946770873369 | 0.41 | 0.41 | 0 | 0.008 | 0.008 |
| 1.555088363526959 | 0.411 | 0.411 | 0 | 0.006 | 0.006 |
| 1.558229956180548 | 0.412 | 0.411 | 0 | 0.005 | 0.005 |
| 1.561371548834138 | 0.412 | 0.412 | 0 | 0.004 | 0.004 |
| 1.564513141487728 | 0.413 | 0.413 | 0 | 0.003 | 0.003 |
| 1.567654734141318 | 0.413 | 0.413 | 0 | 0.001 | 0.001 |
| 1.570796326794908 | 0.414 | 0.414 | 0 | 0 | 0 |
| 1.573937919448497 | 0.415 | 0.415 | 0 | -0.001 | -0.001 |
| 1.577079512102087 | 0.415 | 0.415 | 0 | -0.003 | -0.003 |
| 1.580221104755677 | 0.416 | 0.416 | 0 | -0.004 | -0.004 |
| 1.583362697409267 | 0.417 | 0.417 | 0 | -0.005 | -0.005 |
| 1.586504290062857 | 0.417 | 0.417 | 0 | -0.007 | -0.007 |
| 1.589645882716447 | 0.418 | 0.418 | 0 | -0.008 | -0.008 |
| 1.592787475370036 | 0.419 | 0.419 | 0 | -0.009 | -0.009 |
| 1.595929068023626 | 0.419 | 0.419 | 0 | -0.011 | -0.011 |
| 1.599070660677216 | 0.42 | 0.42 | 0 | -0.012 | -0.012 |
| 1.602212253330806 | 0.421 | 0.421 | 0 | -0.013 | -0.013 |
| 1.605353845984396 | 0.421 | 0.421 | 0.001 | -0.015 | -0.015 |
| 1.608495438637985 | 0.422 | 0.422 | 0.001 | -0.016 | -0.016 |
| 1.611637031291575 | 0.423 | 0.423 | 0.001 | -0.017 | -0.017 |
| 1.614778623945165 | 0.424 | 0.423 | 0.001 | -0.019 | -0.019 |
| 1.617920216598755 | 0.424 | 0.424 | 0.001 | -0.02 | -0.02 |
| 1.621061809252345 | 0.425 | 0.424 | 0.001 | -0.021 | -0.021 |
| 1.624203401905935 | 0.426 | 0.425 | 0.001 | -0.023 | -0.023 |
| 1.627344994559524 | 0.426 | 0.426 | 0.001 | -0.024 | -0.024 |
| 1.630486587213114 | 0.427 | 0.426 | 0.002 | -0.025 | -0.025 |
| 1.633628179866704 | 0.428 | 0.427 | 0.002 | -0.027 | -0.027 |
| 1.636769772520294 | 0.429 | 0.428 | 0.002 | -0.028 | -0.028 |
| 1.639911365173884 | 0.429 | 0.428 | 0.002 | -0.03 | -0.03 |
| 1.643052957827473 | 0.43 | 0.429 | 0.002 | -0.031 | -0.031 |
| 1.646194550481063 | 0.431 | 0.43 | 0.002 | -0.032 | -0.032 |
| 1.649336143134653 | 0.432 | 0.43 | 0.003 | -0.034 | -0.034 |
| 1.652477735788243 | 0.432 | 0.431 | 0.003 | -0.035 | -0.035 |
| 1.655619328441833 | 0.433 | 0.432 | 0.003 | -0.037 | -0.037 |
| 1.658760921095423 | 0.434 | 0.432 | 0.003 | -0.038 | -0.038 |
| 1.661902513749012 | 0.435 | 0.433 | 0.004 | -0.04 | -0.039 |
| 1.665044106402602 | 0.435 | 0.433 | 0.004 | -0.041 | -0.041 |
| 1.668185699056192 | 0.436 | 0.434 | 0.004 | -0.042 | -0.042 |
| 1.671327291709782 | 0.437 | 0.435 | 0.004 | -0.044 | -0.044 |
| 1.674468884363372 | 0.438 | 0.435 | 0.005 | -0.045 | -0.045 |
| 1.677610477016961 | 0.438 | 0.436 | 0.005 | -0.047 | -0.046 |
| 1.680752069670551 | 0.439 | 0.437 | 0.005 | -0.048 | -0.048 |
| 1.683893662324141 | 0.44 | 0.437 | 0.006 | -0.05 | -0.049 |
| 1.687035254977731 | 0.441 | 0.438 | 0.006 | -0.051 | -0.051 |
| 1.690176847631321 | 0.442 | 0.439 | 0.006 | -0.053 | -0.052 |
| 1.693318440284911 | 0.442 | 0.439 | 0.007 | -0.054 | -0.054 |
| 1.6964600329385 | 0.443 | 0.44 | 0.007 | -0.056 | -0.055 |
| 1.69960162559209 | 0.444 | 0.44 | 0.007 | -0.057 | -0.057 |
| 1.70274321824568 | 0.445 | 0.441 | 0.008 | -0.059 | -0.058 |
| 1.70588481089927 | 0.446 | 0.442 | 0.008 | -0.06 | -0.059 |
| 1.70902640355286 | 0.447 | 0.442 | 0.008 | -0.062 | -0.061 |
| 1.712167996206449 | 0.447 | 0.443 | 0.009 | -0.063 | -0.062 |
| 1.715309588860039 | 0.448 | 0.444 | 0.009 | -0.065 | -0.064 |
| 1.71845118151363 | 0.449 | 0.444 | 0.01 | -0.066 | -0.065 |
| 1.721592774167219 | 0.45 | 0.445 | 0.01 | -0.068 | -0.067 |
| 1.724734366820809 | 0.451 | 0.445 | 0.011 | -0.069 | -0.068 |
| 1.727875959474399 | 0.452 | 0.446 | 0.011 | -0.071 | -0.07 |
| 1.731017552127988 | 0.453 | 0.447 | 0.012 | -0.072 | -0.071 |
| 1.734159144781578 | 0.453 | 0.447 | 0.012 | -0.074 | -0.073 |
| 1.737300737435168 | 0.454 | 0.448 | 0.012 | -0.075 | -0.074 |
| 1.740442330088758 | 0.455 | 0.449 | 0.013 | -0.077 | -0.076 |
| 1.743583922742348 | 0.456 | 0.449 | 0.013 | -0.078 | -0.077 |
| 1.746725515395937 | 0.457 | 0.45 | 0.014 | -0.08 | -0.079 |
| 1.749867108049527 | 0.458 | 0.45 | 0.015 | -0.082 | -0.08 |
| 1.753008700703117 | 0.459 | 0.451 | 0.015 | -0.083 | -0.082 |
| 1.756150293356707 | 0.46 | 0.452 | 0.016 | -0.085 | -0.083 |
| 1.759291886010297 | 0.46 | 0.452 | 0.016 | -0.086 | -0.085 |
| 1.762433478663887 | 0.461 | 0.453 | 0.017 | -0.088 | -0.086 |
| 1.765575071317476 | 0.462 | 0.454 | 0.017 | -0.089 | -0.088 |
| 1.768716663971066 | 0.463 | 0.454 | 0.018 | -0.091 | -0.089 |
| 1.771858256624656 | 0.464 | 0.455 | 0.019 | -0.093 | -0.091 |
| 1.774999849278246 | 0.465 | 0.455 | 0.019 | -0.094 | -0.092 |
| 1.778141441931836 | 0.466 | 0.456 | 0.02 | -0.096 | -0.094 |
| 1.781283034585426 | 0.467 | 0.457 | 0.02 | -0.098 | -0.095 |
| 1.784424627239015 | 0.468 | 0.457 | 0.021 | -0.099 | -0.097 |
| 1.787566219892605 | 0.469 | 0.458 | 0.022 | -0.101 | -0.098 |
| 1.790707812546195 | 0.47 | 0.459 | 0.022 | -0.102 | -0.1 |
| 1.793849405199785 | 0.471 | 0.459 | 0.023 | -0.104 | -0.102 |
| 1.796990997853375 | 0.472 | 0.46 | 0.024 | -0.106 | -0.103 |
| 1.800132590506964 | 0.473 | 0.46 | 0.024 | -0.107 | -0.105 |
| 1.803274183160554 | 0.474 | 0.461 | 0.025 | -0.109 | -0.106 |
| 1.806415775814144 | 0.475 | 0.462 | 0.026 | -0.111 | -0.108 |
| 1.809557368467734 | 0.476 | 0.462 | 0.027 | -0.112 | -0.109 |
| 1.812698961121324 | 0.477 | 0.463 | 0.027 | -0.114 | -0.111 |
| 1.815840553774914 | 0.478 | 0.463 | 0.028 | -0.116 | -0.112 |
| 1.818982146428503 | 0.479 | 0.464 | 0.029 | -0.118 | -0.114 |
| 1.822123739082093 | 0.48 | 0.465 | 0.03 | -0.119 | -0.116 |
| 1.825265331735683 | 0.481 | 0.465 | 0.03 | -0.121 | -0.117 |
| 1.828406924389273 | 0.482 | 0.466 | 0.031 | -0.123 | -0.119 |
| 1.831548517042863 | 0.483 | 0.466 | 0.032 | -0.124 | -0.12 |
| 1.834690109696452 | 0.484 | 0.467 | 0.033 | -0.126 | -0.122 |
| 1.837831702350042 | 0.485 | 0.468 | 0.034 | -0.128 | -0.123 |
| 1.840973295003632 | 0.486 | 0.468 | 0.035 | -0.13 | -0.125 |
| 1.844114887657222 | 0.487 | 0.469 | 0.035 | -0.131 | -0.127 |
| 1.847256480310812 | 0.488 | 0.469 | 0.036 | -0.133 | -0.128 |
| 1.850398072964402 | 0.489 | 0.47 | 0.037 | -0.135 | -0.13 |
| 1.853539665617991 | 0.49 | 0.471 | 0.038 | -0.137 | -0.131 |
| 1.856681258271581 | 0.491 | 0.471 | 0.039 | -0.139 | -0.133 |
| 1.859822850925171 | 0.492 | 0.472 | 0.04 | -0.14 | -0.134 |
| 1.862964443578761 | 0.493 | 0.472 | 0.041 | -0.142 | -0.136 |
| 1.866106036232351 | 0.494 | 0.473 | 0.042 | -0.144 | -0.138 |
| 1.86924762888594 | 0.495 | 0.474 | 0.043 | -0.146 | -0.139 |
| 1.87238922153953 | 0.497 | 0.474 | 0.044 | -0.148 | -0.141 |
| 1.87553081419312 | 0.498 | 0.475 | 0.045 | -0.149 | -0.142 |
| 1.87867240684671 | 0.499 | 0.475 | 0.046 | -0.151 | -0.144 |
| 1.8818139995003 | 0.5 | 0.476 | 0.047 | -0.153 | -0.146 |
| 1.88495559215389 | 0.501 | 0.477 | 0.048 | -0.155 | -0.147 |
| 1.888097184807479 | 0.502 | 0.477 | 0.049 | -0.157 | -0.149 |
| 1.891238777461069 | 0.503 | 0.478 | 0.05 | -0.159 | -0.15 |
| 1.89438037011466 | 0.504 | 0.478 | 0.051 | -0.16 | -0.152 |
| 1.897521962768249 | 0.506 | 0.479 | 0.052 | -0.162 | -0.154 |
| 1.900663555421839 | 0.507 | 0.479 | 0.053 | -0.164 | -0.155 |
| 1.903805148075429 | 0.508 | 0.48 | 0.054 | -0.166 | -0.157 |
| 1.906946740729018 | 0.509 | 0.481 | 0.055 | -0.168 | -0.159 |
| 1.910088333382608 | 0.51 | 0.481 | 0.057 | -0.17 | -0.16 |
| 1.913229926036198 | 0.511 | 0.482 | 0.058 | -0.172 | -0.162 |
| 1.916371518689788 | 0.513 | 0.482 | 0.059 | -0.174 | -0.163 |
| 1.919513111343378 | 0.514 | 0.483 | 0.06 | -0.176 | -0.165 |
| 1.922654703996967 | 0.515 | 0.483 | 0.061 | -0.177 | -0.167 |
| 1.925796296650557 | 0.516 | 0.484 | 0.062 | -0.179 | -0.168 |
| 1.928937889304147 | 0.517 | 0.485 | 0.064 | -0.181 | -0.17 |
| 1.932079481957737 | 0.519 | 0.485 | 0.065 | -0.183 | -0.171 |
| 1.935221074611327 | 0.52 | 0.486 | 0.066 | -0.185 | -0.173 |
| 1.938362667264917 | 0.521 | 0.486 | 0.067 | -0.187 | -0.175 |
| 1.941504259918506 | 0.522 | 0.487 | 0.069 | -0.189 | -0.176 |
| 1.944645852572096 | 0.524 | 0.487 | 0.07 | -0.191 | -0.178 |
| 1.947787445225686 | 0.525 | 0.488 | 0.071 | -0.193 | -0.18 |
| 1.950929037879276 | 0.526 | 0.489 | 0.072 | -0.195 | -0.181 |
| 1.954070630532866 | 0.527 | 0.489 | 0.074 | -0.197 | -0.183 |
| 1.957212223186455 | 0.529 | 0.49 | 0.075 | -0.199 | -0.185 |
| 1.960353815840045 | 0.53 | 0.49 | 0.076 | -0.201 | -0.186 |
| 1.963495408493635 | 0.531 | 0.491 | 0.078 | -0.203 | -0.188 |
| 1.966637001147225 | 0.532 | 0.491 | 0.079 | -0.205 | -0.189 |
| 1.969778593800815 | 0.534 | 0.492 | 0.081 | -0.207 | -0.191 |
| 1.972920186454405 | 0.535 | 0.492 | 0.082 | -0.209 | -0.193 |
| 1.976061779107994 | 0.536 | 0.493 | 0.083 | -0.211 | -0.194 |
| 1.979203371761584 | 0.538 | 0.493 | 0.085 | -0.214 | -0.196 |
| 1.982344964415174 | 0.539 | 0.494 | 0.086 | -0.216 | -0.198 |
| 1.985486557068764 | 0.54 | 0.495 | 0.088 | -0.218 | -0.199 |
| 1.988628149722354 | 0.542 | 0.495 | 0.089 | -0.22 | -0.201 |
| 1.991769742375943 | 0.543 | 0.496 | 0.091 | -0.222 | -0.203 |
| 1.994911335029533 | 0.544 | 0.496 | 0.092 | -0.224 | -0.204 |
| 1.998052927683123 | 0.546 | 0.497 | 0.094 | -0.226 | -0.206 |
| 2.001194520336712 | 0.547 | 0.497 | 0.095 | -0.228 | -0.207 |
| 2.004336112990302 | 0.548 | 0.498 | 0.097 | -0.23 | -0.209 |
| 2.007477705643892 | 0.55 | 0.498 | 0.098 | -0.233 | -0.211 |
| 2.010619298297482 | 0.551 | 0.499 | 0.1 | -0.235 | -0.212 |
| 2.013760890951071 | 0.553 | 0.499 | 0.102 | -0.237 | -0.214 |
| 2.016902483604661 | 0.554 | 0.5 | 0.103 | -0.239 | -0.216 |
| 2.02004407625825 | 0.555 | 0.5 | 0.105 | -0.241 | -0.217 |
| 2.02318566891184 | 0.557 | 0.501 | 0.106 | -0.243 | -0.219 |
| 2.02632726156543 | 0.558 | 0.501 | 0.108 | -0.246 | -0.221 |
| 2.029468854219019 | 0.56 | 0.502 | 0.11 | -0.248 | -0.222 |
| 2.032610446872609 | 0.561 | 0.502 | 0.111 | -0.25 | -0.224 |
| 2.035752039526198 | 0.563 | 0.503 | 0.113 | -0.252 | -0.225 |
| 2.038893632179788 | 0.564 | 0.503 | 0.115 | -0.255 | -0.227 |
| 2.042035224833378 | 0.566 | 0.504 | 0.117 | -0.257 | -0.229 |
| 2.045176817486967 | 0.567 | 0.504 | 0.118 | -0.259 | -0.23 |
| 2.048318410140557 | 0.569 | 0.505 | 0.12 | -0.261 | -0.232 |
| 2.051460002794146 | 0.57 | 0.505 | 0.122 | -0.264 | -0.234 |
| 2.054601595447736 | 0.572 | 0.506 | 0.124 | -0.266 | -0.235 |
| 2.057743188101325 | 0.573 | 0.506 | 0.125 | -0.268 | -0.237 |
| 2.060884780754915 | 0.575 | 0.507 | 0.127 | -0.27 | -0.239 |
| 2.064026373408505 | 0.576 | 0.507 | 0.129 | -0.273 | -0.24 |
| 2.067167966062094 | 0.578 | 0.508 | 0.131 | -0.275 | -0.242 |
| 2.070309558715684 | 0.579 | 0.508 | 0.133 | -0.277 | -0.244 |
| 2.073451151369273 | 0.581 | 0.509 | 0.135 | -0.28 | -0.245 |
| 2.076592744022863 | 0.582 | 0.509 | 0.137 | -0.282 | -0.247 |
| 2.079734336676452 | 0.584 | 0.51 | 0.139 | -0.284 | -0.248 |
| 2.082875929330042 | 0.585 | 0.51 | 0.141 | -0.287 | -0.25 |
| 2.086017521983632 | 0.587 | 0.511 | 0.143 | -0.289 | -0.252 |
| 2.089159114637221 | 0.589 | 0.511 | 0.144 | -0.292 | -0.253 |
| 2.092300707290811 | 0.59 | 0.512 | 0.146 | -0.294 | -0.255 |
| 2.095442299944401 | 0.592 | 0.512 | 0.148 | -0.296 | -0.257 |
| 2.09858389259799 | 0.593 | 0.513 | 0.15 | -0.299 | -0.258 |
| 2.10172548525158 | 0.595 | 0.513 | 0.153 | -0.301 | -0.26 |
| 2.104867077905169 | 0.597 | 0.514 | 0.155 | -0.304 | -0.261 |
| 2.108008670558759 | 0.598 | 0.514 | 0.157 | -0.306 | -0.263 |
| 2.111150263212349 | 0.6 | 0.514 | 0.159 | -0.309 | -0.265 |
| 2.114291855865938 | 0.602 | 0.515 | 0.161 | -0.311 | -0.266 |
| 2.117433448519528 | 0.603 | 0.515 | 0.163 | -0.314 | -0.268 |
| 2.120575041173117 | 0.605 | 0.516 | 0.165 | -0.316 | -0.269 |
| 2.123716633826707 | 0.607 | 0.516 | 0.167 | -0.319 | -0.271 |
| 2.126858226480297 | 0.608 | 0.517 | 0.169 | -0.321 | -0.273 |
| 2.129999819133886 | 0.61 | 0.517 | 0.172 | -0.324 | -0.274 |
| 2.133141411787476 | 0.612 | 0.518 | 0.174 | -0.326 | -0.276 |
| 2.136283004441065 | 0.613 | 0.518 | 0.176 | -0.329 | -0.278 |
| 2.139424597094655 | 0.615 | 0.518 | 0.178 | -0.331 | -0.279 |
| 2.142566189748245 | 0.617 | 0.519 | 0.181 | -0.334 | -0.281 |
| 2.145707782401834 | 0.619 | 0.519 | 0.183 | -0.336 | -0.282 |
| 2.148849375055424 | 0.62 | 0.52 | 0.185 | -0.339 | -0.284 |
| 2.151990967709013 | 0.622 | 0.52 | 0.188 | -0.342 | -0.286 |
| 2.155132560362603 | 0.624 | 0.52 | 0.19 | -0.344 | -0.287 |
| 2.158274153016193 | 0.626 | 0.521 | 0.192 | -0.347 | -0.289 |
| 2.161415745669782 | 0.628 | 0.521 | 0.195 | -0.349 | -0.29 |
| 2.164557338323372 | 0.629 | 0.522 | 0.197 | -0.352 | -0.292 |
| 2.167698930976961 | 0.631 | 0.522 | 0.199 | -0.355 | -0.293 |
| 2.170840523630551 | 0.633 | 0.522 | 0.202 | -0.357 | -0.295 |
| 2.173982116284141 | 0.635 | 0.523 | 0.204 | -0.36 | -0.297 |
| 2.17712370893773 | 0.637 | 0.523 | 0.207 | -0.363 | -0.298 |
| 2.18026530159132 | 0.639 | 0.524 | 0.209 | -0.366 | -0.3 |
| 2.183406894244909 | 0.64 | 0.524 | 0.212 | -0.368 | -0.301 |
| 2.186548486898499 | 0.642 | 0.524 | 0.214 | -0.371 | -0.303 |
| 2.189690079552089 | 0.644 | 0.525 | 0.217 | -0.374 | -0.304 |
| 2.192831672205678 | 0.646 | 0.525 | 0.219 | -0.376 | -0.306 |
| 2.195973264859268 | 0.648 | 0.525 | 0.222 | -0.379 | -0.308 |
| 2.199114857512857 | 0.65 | 0.526 | 0.225 | -0.382 | -0.309 |
| 2.202256450166447 | 0.652 | 0.526 | 0.227 | -0.385 | -0.311 |
| 2.205398042820036 | 0.654 | 0.527 | 0.23 | -0.388 | -0.312 |
| 2.208539635473626 | 0.656 | 0.527 | 0.232 | -0.39 | -0.314 |
| 2.211681228127216 | 0.658 | 0.527 | 0.235 | -0.393 | -0.315 |
| 2.214822820780805 | 0.66 | 0.528 | 0.238 | -0.396 | -0.317 |
| 2.217964413434395 | 0.662 | 0.528 | 0.241 | -0.399 | -0.318 |
| 2.221106006087984 | 0.664 | 0.528 | 0.243 | -0.402 | -0.32 |
| 2.224247598741574 | 0.666 | 0.529 | 0.246 | -0.405 | -0.321 |
| 2.227389191395164 | 0.668 | 0.529 | 0.249 | -0.408 | -0.323 |
| 2.230530784048753 | 0.67 | 0.529 | 0.252 | -0.41 | -0.324 |
| 2.233672376702343 | 0.672 | 0.53 | 0.254 | -0.413 | -0.326 |
| 2.236813969355933 | 0.674 | 0.53 | 0.257 | -0.416 | -0.327 |
| 2.239955562009522 | 0.676 | 0.53 | 0.26 | -0.419 | -0.329 |
| 2.243097154663112 | 0.678 | 0.53 | 0.263 | -0.422 | -0.33 |
| 2.246238747316701 | 0.68 | 0.531 | 0.266 | -0.425 | -0.332 |
| 2.249380339970291 | 0.682 | 0.531 | 0.269 | -0.428 | -0.333 |
| 2.252521932623881 | 0.684 | 0.531 | 0.272 | -0.431 | -0.335 |
| 2.25566352527747 | 0.686 | 0.532 | 0.275 | -0.434 | -0.336 |
| 2.25880511793106 | 0.689 | 0.532 | 0.278 | -0.437 | -0.338 |
| 2.261946710584649 | 0.691 | 0.532 | 0.281 | -0.44 | -0.339 |
| 2.265088303238239 | 0.693 | 0.532 | 0.284 | -0.443 | -0.341 |
| 2.268229895891829 | 0.695 | 0.533 | 0.287 | -0.446 | -0.342 |
| 2.271371488545418 | 0.697 | 0.533 | 0.29 | -0.449 | -0.344 |
| 2.274513081199008 | 0.699 | 0.533 | 0.293 | -0.453 | -0.345 |
| 2.277654673852597 | 0.702 | 0.533 | 0.296 | -0.456 | -0.346 |
| 2.280796266506186 | 0.704 | 0.534 | 0.299 | -0.459 | -0.348 |
| 2.283937859159776 | 0.706 | 0.534 | 0.302 | -0.462 | -0.349 |
| 2.287079451813366 | 0.708 | 0.534 | 0.305 | -0.465 | -0.351 |
| 2.290221044466955 | 0.71 | 0.534 | 0.308 | -0.468 | -0.352 |
| 2.293362637120545 | 0.713 | 0.535 | 0.312 | -0.471 | -0.354 |
| 2.296504229774135 | 0.715 | 0.535 | 0.315 | -0.475 | -0.355 |
| 2.299645822427724 | 0.717 | 0.535 | 0.318 | -0.478 | -0.356 |
| 2.302787415081314 | 0.72 | 0.535 | 0.321 | -0.481 | -0.358 |
| 2.305929007734904 | 0.722 | 0.535 | 0.325 | -0.484 | -0.359 |
| 2.309070600388493 | 0.724 | 0.536 | 0.328 | -0.487 | -0.361 |
| 2.312212193042083 | 0.727 | 0.536 | 0.331 | -0.491 | -0.362 |
| 2.315353785695672 | 0.729 | 0.536 | 0.335 | -0.494 | -0.363 |
| 2.318495378349262 | 0.731 | 0.536 | 0.338 | -0.497 | -0.365 |
| 2.321636971002852 | 0.734 | 0.536 | 0.342 | -0.501 | -0.366 |
| 2.324778563656441 | 0.736 | 0.537 | 0.345 | -0.504 | -0.367 |
| 2.327920156310031 | 0.738 | 0.537 | 0.348 | -0.507 | -0.369 |
| 2.33106174896362 | 0.741 | 0.537 | 0.352 | -0.511 | -0.37 |
| 2.33420334161721 | 0.743 | 0.537 | 0.355 | -0.514 | -0.371 |
| 2.3373449342708 | 0.746 | 0.537 | 0.359 | -0.517 | -0.373 |
| 2.340486526924389 | 0.748 | 0.537 | 0.362 | -0.521 | -0.374 |
| 2.343628119577979 | 0.751 | 0.537 | 0.366 | -0.524 | -0.375 |
| 2.346769712231568 | 0.753 | 0.538 | 0.369 | -0.528 | -0.377 |
| 2.349911304885158 | 0.756 | 0.538 | 0.373 | -0.531 | -0.378 |
| 2.353052897538748 | 0.758 | 0.538 | 0.377 | -0.534 | -0.379 |
| 2.356194490192337 | 0.761 | 0.538 | 0.38 | -0.538 | -0.38 |
| 2.359336082845927 | 0.763 | 0.538 | 0.384 | -0.541 | -0.382 |
| 2.362477675499516 | 0.766 | 0.538 | 0.388 | -0.545 | -0.383 |
| 2.365619268153106 | 0.768 | 0.538 | 0.391 | -0.548 | -0.384 |
| 2.368760860806696 | 0.771 | 0.538 | 0.395 | -0.552 | -0.385 |
| 2.371902453460285 | 0.774 | 0.538 | 0.399 | -0.556 | -0.387 |
| 2.375044046113875 | 0.776 | 0.538 | 0.403 | -0.559 | -0.388 |
| 2.378185638767464 | 0.779 | 0.538 | 0.407 | -0.563 | -0.389 |
| 2.381327231421054 | 0.781 | 0.539 | 0.41 | -0.566 | -0.39 |
| 2.384468824074644 | 0.784 | 0.539 | 0.414 | -0.57 | -0.391 |
| 2.387610416728233 | 0.787 | 0.539 | 0.418 | -0.574 | -0.393 |
| 2.390752009381823 | 0.789 | 0.539 | 0.422 | -0.577 | -0.394 |
| 2.393893602035412 | 0.792 | 0.539 | 0.426 | -0.581 | -0.395 |
| 2.397035194689002 | 0.795 | 0.539 | 0.43 | -0.585 | -0.396 |
| 2.400176787342591 | 0.798 | 0.539 | 0.434 | -0.588 | -0.397 |
| 2.403318379996181 | 0.8 | 0.539 | 0.438 | -0.592 | -0.398 |
| 2.406459972649771 | 0.803 | 0.539 | 0.442 | -0.596 | -0.4 |
| 2.40960156530336 | 0.806 | 0.539 | 0.446 | -0.599 | -0.401 |
| 2.41274315795695 | 0.809 | 0.539 | 0.45 | -0.603 | -0.402 |
| 2.41588475061054 | 0.812 | 0.539 | 0.454 | -0.607 | -0.403 |
| 2.419026343264129 | 0.814 | 0.539 | 0.458 | -0.611 | -0.404 |
| 2.422167935917719 | 0.817 | 0.538 | 0.462 | -0.615 | -0.405 |
| 2.425309528571308 | 0.82 | 0.538 | 0.467 | -0.619 | -0.406 |
| 2.428451121224898 | 0.823 | 0.538 | 0.471 | -0.622 | -0.407 |
| 2.431592713878488 | 0.826 | 0.538 | 0.475 | -0.626 | -0.408 |
| 2.434734306532077 | 0.829 | 0.538 | 0.479 | -0.63 | -0.409 |
| 2.437875899185667 | 0.832 | 0.538 | 0.483 | -0.634 | -0.41 |
| 2.441017491839256 | 0.835 | 0.538 | 0.488 | -0.638 | -0.411 |
| 2.444159084492846 | 0.838 | 0.538 | 0.492 | -0.642 | -0.412 |
| 2.447300677146435 | 0.841 | 0.538 | 0.496 | -0.646 | -0.413 |
| 2.450442269800025 | 0.844 | 0.538 | 0.501 | -0.65 | -0.414 |
| 2.453583862453615 | 0.847 | 0.538 | 0.505 | -0.654 | -0.415 |
| 2.456725455107204 | 0.85 | 0.537 | 0.51 | -0.658 | -0.416 |
| 2.459867047760794 | 0.853 | 0.537 | 0.514 | -0.662 | -0.417 |
| 2.463008640414384 | 0.856 | 0.537 | 0.519 | -0.666 | -0.418 |
| 2.466150233067973 | 0.859 | 0.537 | 0.523 | -0.67 | -0.419 |
| 2.469291825721563 | 0.862 | 0.537 | 0.528 | -0.674 | -0.42 |
| 2.472433418375152 | 0.865 | 0.537 | 0.532 | -0.678 | -0.421 |
| 2.475575011028742 | 0.868 | 0.536 | 0.537 | -0.683 | -0.422 |
| 2.478716603682332 | 0.871 | 0.536 | 0.541 | -0.687 | -0.423 |
| 2.481858196335921 | 0.874 | 0.536 | 0.546 | -0.691 | -0.423 |
| 2.48499978898951 | 0.878 | 0.536 | 0.551 | -0.695 | -0.424 |
| 2.4881413816431 | 0.881 | 0.535 | 0.555 | -0.699 | -0.425 |
| 2.49128297429669 | 0.884 | 0.535 | 0.56 | -0.704 | -0.426 |
| 2.49442456695028 | 0.887 | 0.535 | 0.565 | -0.708 | -0.427 |
| 2.497566159603869 | 0.89 | 0.535 | 0.569 | -0.712 | -0.428 |
| 2.500707752257458 | 0.894 | 0.534 | 0.574 | -0.716 | -0.428 |
| 2.503849344911048 | 0.897 | 0.534 | 0.579 | -0.721 | -0.429 |
| 2.506990937564638 | 0.9 | 0.534 | 0.584 | -0.725 | -0.43 |
| 2.510132530218228 | 0.904 | 0.533 | 0.589 | -0.729 | -0.431 |
| 2.513274122871817 | 0.907 | 0.533 | 0.594 | -0.734 | -0.431 |
| 2.516415715525407 | 0.91 | 0.533 | 0.599 | -0.738 | -0.432 |
| 2.519557308178996 | 0.914 | 0.532 | 0.603 | -0.743 | -0.433 |
| 2.522698900832586 | 0.917 | 0.532 | 0.608 | -0.747 | -0.433 |
| 2.525840493486176 | 0.921 | 0.532 | 0.613 | -0.751 | -0.434 |
| 2.528982086139765 | 0.924 | 0.531 | 0.618 | -0.756 | -0.435 |
| 2.532123678793355 | 0.927 | 0.531 | 0.624 | -0.76 | -0.435 |
| 2.535265271446944 | 0.931 | 0.53 | 0.629 | -0.765 | -0.436 |
| 2.538406864100534 | 0.934 | 0.53 | 0.634 | -0.77 | -0.437 |
| 2.541548456754124 | 0.938 | 0.53 | 0.639 | -0.774 | -0.437 |
| 2.544690049407713 | 0.942 | 0.529 | 0.644 | -0.779 | -0.438 |
| 2.547831642061302 | 0.945 | 0.529 | 0.649 | -0.783 | -0.438 |
| 2.550973234714892 | 0.949 | 0.528 | 0.654 | -0.788 | -0.439 |
| 2.554114827368482 | 0.952 | 0.528 | 0.66 | -0.793 | -0.439 |
| 2.557256420022072 | 0.956 | 0.527 | 0.665 | -0.797 | -0.44 |
| 2.560398012675661 | 0.96 | 0.527 | 0.67 | -0.802 | -0.44 |
| 2.563539605329251 | 0.963 | 0.526 | 0.676 | -0.807 | -0.441 |
| 2.56668119798284 | 0.967 | 0.526 | 0.681 | -0.811 | -0.441 |
| 2.56982279063643 | 0.971 | 0.525 | 0.686 | -0.816 | -0.442 |
| 2.57296438329002 | 0.974 | 0.525 | 0.692 | -0.821 | -0.442 |
| 2.576105975943609 | 0.978 | 0.524 | 0.697 | -0.826 | -0.442 |
| 2.579247568597199 | 0.982 | 0.523 | 0.703 | -0.831 | -0.443 |
| 2.582389161250788 | 0.986 | 0.523 | 0.708 | -0.835 | -0.443 |
| 2.585530753904377 | 0.989 | 0.522 | 0.714 | -0.84 | -0.444 |
| 2.588672346557967 | 0.993 | 0.522 | 0.719 | -0.845 | -0.444 |
| 2.591813939211557 | 0.997 | 0.521 | 0.725 | -0.85 | -0.444 |
| 2.594955531865147 | 1.001 | 0.52 | 0.731 | -0.855 | -0.445 |
| 2.598097124518736 | 1.005 | 0.52 | 0.736 | -0.86 | -0.445 |
| 2.601238717172326 | 1.009 | 0.519 | 0.742 | -0.865 | -0.445 |
| 2.604380309825915 | 1.013 | 0.518 | 0.748 | -0.87 | -0.445 |
| 2.607521902479505 | 1.017 | 0.518 | 0.753 | -0.875 | -0.445 |
| 2.610663495133095 | 1.021 | 0.517 | 0.759 | -0.88 | -0.446 |
| 2.613805087786684 | 1.025 | 0.516 | 0.765 | -0.885 | -0.446 |
| 2.616946680440274 | 1.029 | 0.515 | 0.771 | -0.89 | -0.446 |
| 2.620088273093863 | 1.033 | 0.515 | 0.777 | -0.896 | -0.446 |
| 2.623229865747452 | 1.037 | 0.514 | 0.782 | -0.901 | -0.446 |
| 2.626371458401042 | 1.041 | 0.513 | 0.788 | -0.906 | -0.446 |
| 2.629513051054632 | 1.045 | 0.512 | 0.794 | -0.911 | -0.446 |
| 2.632654643708222 | 1.049 | 0.511 | 0.8 | -0.916 | -0.446 |
| 2.635796236361811 | 1.054 | 0.51 | 0.806 | -0.922 | -0.447 |
| 2.638937829015401 | 1.058 | 0.51 | 0.812 | -0.927 | -0.447 |
| 2.642079421668991 | 1.062 | 0.509 | 0.818 | -0.932 | -0.447 |
| 2.64522101432258 | 1.066 | 0.508 | 0.824 | -0.938 | -0.446 |
| 2.64836260697617 | 1.07 | 0.507 | 0.831 | -0.943 | -0.446 |
| 2.651504199629759 | 1.075 | 0.506 | 0.837 | -0.948 | -0.446 |
| 2.654645792283349 | 1.079 | 0.505 | 0.843 | -0.954 | -0.446 |
| 2.657787384936938 | 1.083 | 0.504 | 0.849 | -0.959 | -0.446 |
| 2.660928977590528 | 1.088 | 0.503 | 0.855 | -0.965 | -0.446 |
| 2.664070570244118 | 1.092 | 0.502 | 0.862 | -0.97 | -0.446 |
| 2.667212162897707 | 1.097 | 0.501 | 0.868 | -0.976 | -0.446 |
| 2.670353755551297 | 1.101 | 0.5 | 0.874 | -0.981 | -0.445 |
| 2.673495348204887 | 1.106 | 0.499 | 0.881 | -0.987 | -0.445 |
| 2.676636940858476 | 1.11 | 0.498 | 0.887 | -0.992 | -0.445 |
| 2.679778533512066 | 1.115 | 0.497 | 0.893 | -0.998 | -0.445 |
| 2.682920126165655 | 1.119 | 0.496 | 0.9 | -1.004 | -0.444 |
| 2.686061718819245 | 1.124 | 0.494 | 0.906 | -1.009 | -0.444 |
| 2.689203311472835 | 1.128 | 0.493 | 0.913 | -1.015 | -0.444 |
| 2.692344904126424 | 1.133 | 0.492 | 0.919 | -1.021 | -0.443 |
| 2.695486496780014 | 1.138 | 0.491 | 0.926 | -1.026 | -0.443 |
| 2.698628089433603 | 1.142 | 0.49 | 0.933 | -1.032 | -0.442 |
| 2.701769682087193 | 1.147 | 0.488 | 0.939 | -1.038 | -0.442 |
| 2.704911274740782 | 1.152 | 0.487 | 0.946 | -1.044 | -0.441 |
| 2.708052867394372 | 1.157 | 0.486 | 0.952 | -1.05 | -0.441 |
| 2.711194460047962 | 1.161 | 0.485 | 0.959 | -1.055 | -0.44 |
| 2.714336052701551 | 1.166 | 0.483 | 0.966 | -1.061 | -0.44 |
| 2.717477645355141 | 1.171 | 0.482 | 0.973 | -1.067 | -0.439 |
| 2.720619238008731 | 1.176 | 0.481 | 0.98 | -1.073 | -0.439 |
| 2.72376083066232 | 1.181 | 0.479 | 0.986 | -1.079 | -0.438 |
| 2.72690242331591 | 1.186 | 0.478 | 0.993 | -1.085 | -0.437 |
| 2.730044015969499 | 1.191 | 0.476 | 1 | -1.091 | -0.437 |
| 2.733185608623089 | 1.196 | 0.475 | 1.007 | -1.097 | -0.436 |
| 2.736327201276678 | 1.201 | 0.473 | 1.014 | -1.104 | -0.435 |
| 2.739468793930268 | 1.206 | 0.472 | 1.021 | -1.11 | -0.434 |
| 2.742610386583858 | 1.211 | 0.47 | 1.028 | -1.116 | -0.433 |
| 2.745751979237447 | 1.216 | 0.469 | 1.035 | -1.122 | -0.433 |
| 2.748893571891036 | 1.221 | 0.467 | 1.042 | -1.128 | -0.432 |
| 2.752035164544627 | 1.226 | 0.466 | 1.049 | -1.134 | -0.431 |
| 2.755176757198216 | 1.232 | 0.464 | 1.057 | -1.141 | -0.43 |
| 2.758318349851806 | 1.237 | 0.463 | 1.064 | -1.147 | -0.429 |
| 2.761459942505395 | 1.242 | 0.461 | 1.071 | -1.153 | -0.428 |
| 2.764601535158985 | 1.247 | 0.459 | 1.078 | -1.16 | -0.427 |
| 2.767743127812574 | 1.253 | 0.457 | 1.086 | -1.166 | -0.426 |
| 2.770884720466164 | 1.258 | 0.456 | 1.093 | -1.173 | -0.425 |
| 2.774026313119754 | 1.263 | 0.454 | 1.1 | -1.179 | -0.424 |
| 2.777167905773343 | 1.269 | 0.452 | 1.108 | -1.185 | -0.423 |
| 2.780309498426932 | 1.274 | 0.45 | 1.115 | -1.192 | -0.421 |
| 2.783451091080522 | 1.28 | 0.449 | 1.122 | -1.198 | -0.42 |
| 2.786592683734112 | 1.285 | 0.447 | 1.13 | -1.205 | -0.419 |
| 2.789734276387701 | 1.291 | 0.445 | 1.137 | -1.212 | -0.418 |
| 2.792875869041291 | 1.296 | 0.443 | 1.145 | -1.218 | -0.416 |
| 2.796017461694881 | 1.302 | 0.441 | 1.153 | -1.225 | -0.415 |
| 2.79915905434847 | 1.308 | 0.439 | 1.16 | -1.232 | -0.414 |
| 2.80230064700206 | 1.313 | 0.437 | 1.168 | -1.238 | -0.412 |
| 2.80544223965565 | 1.319 | 0.435 | 1.175 | -1.245 | -0.411 |
| 2.808583832309239 | 1.325 | 0.433 | 1.183 | -1.252 | -0.409 |
| 2.811725424962829 | 1.33 | 0.431 | 1.191 | -1.259 | -0.408 |
| 2.814867017616419 | 1.336 | 0.429 | 1.199 | -1.265 | -0.406 |
| 2.818008610270008 | 1.342 | 0.427 | 1.206 | -1.272 | -0.405 |
| 2.821150202923598 | 1.348 | 0.425 | 1.214 | -1.279 | -0.403 |
| 2.824291795577187 | 1.354 | 0.422 | 1.222 | -1.286 | -0.401 |
| 2.827433388230777 | 1.36 | 0.42 | 1.23 | -1.293 | -0.4 |
| 2.830574980884366 | 1.366 | 0.418 | 1.238 | -1.3 | -0.398 |
| 2.833716573537956 | 1.372 | 0.416 | 1.246 | -1.307 | -0.396 |
| 2.836858166191546 | 1.378 | 0.413 | 1.254 | -1.314 | -0.394 |
| 2.839999758845135 | 1.384 | 0.411 | 1.262 | -1.321 | -0.392 |
| 2.843141351498725 | 1.39 | 0.409 | 1.27 | -1.328 | -0.391 |
| 2.846282944152314 | 1.396 | 0.406 | 1.278 | -1.336 | -0.389 |
| 2.849424536805904 | 1.402 | 0.404 | 1.286 | -1.343 | -0.387 |
| 2.852566129459494 | 1.408 | 0.401 | 1.294 | -1.35 | -0.385 |
| 2.855707722113083 | 1.415 | 0.399 | 1.302 | -1.357 | -0.383 |
| 2.858849314766673 | 1.421 | 0.396 | 1.31 | -1.364 | -0.381 |
| 2.861990907420262 | 1.427 | 0.394 | 1.318 | -1.372 | -0.379 |
| 2.865132500073852 | 1.434 | 0.391 | 1.327 | -1.379 | -0.376 |
| 2.868274092727442 | 1.44 | 0.389 | 1.335 | -1.386 | -0.374 |
| 2.871415685381031 | 1.446 | 0.386 | 1.343 | -1.394 | -0.372 |
| 2.874557278034621 | 1.453 | 0.383 | 1.352 | -1.401 | -0.37 |
| 2.87769887068821 | 1.459 | 0.381 | 1.36 | -1.409 | -0.367 |
| 2.8808404633418 | 1.466 | 0.378 | 1.368 | -1.416 | -0.365 |
| 2.88398205599539 | 1.472 | 0.375 | 1.377 | -1.424 | -0.363 |
| 2.88712364864898 | 1.479 | 0.372 | 1.385 | -1.431 | -0.36 |
| 2.890265241302569 | 1.486 | 0.369 | 1.394 | -1.439 | -0.358 |
| 2.893406833956158 | 1.492 | 0.367 | 1.402 | -1.447 | -0.355 |
| 2.896548426609748 | 1.499 | 0.364 | 1.411 | -1.454 | -0.353 |
| 2.899690019263338 | 1.506 | 0.361 | 1.419 | -1.462 | -0.35 |
| 2.902831611916927 | 1.513 | 0.358 | 1.428 | -1.47 | -0.348 |
| 2.905973204570517 | 1.519 | 0.355 | 1.437 | -1.477 | -0.345 |
| 2.909114797224106 | 1.526 | 0.352 | 1.445 | -1.485 | -0.342 |
| 2.912256389877696 | 1.533 | 0.349 | 1.454 | -1.493 | -0.339 |
| 2.915397982531286 | 1.54 | 0.345 | 1.463 | -1.501 | -0.337 |
| 2.918539575184875 | 1.547 | 0.342 | 1.471 | -1.509 | -0.334 |
| 2.921681167838465 | 1.554 | 0.339 | 1.48 | -1.517 | -0.331 |
| 2.924822760492054 | 1.561 | 0.336 | 1.489 | -1.525 | -0.328 |
| 2.927964353145644 | 1.568 | 0.332 | 1.498 | -1.533 | -0.325 |
| 2.931105945799234 | 1.575 | 0.329 | 1.507 | -1.541 | -0.322 |
| 2.934247538452823 | 1.583 | 0.326 | 1.515 | -1.549 | -0.319 |
| 2.937389131106413 | 1.59 | 0.322 | 1.524 | -1.557 | -0.316 |
| 2.940530723760002 | 1.597 | 0.319 | 1.533 | -1.565 | -0.313 |
| 2.943672316413592 | 1.604 | 0.315 | 1.542 | -1.573 | -0.309 |
| 2.946813909067182 | 1.612 | 0.312 | 1.551 | -1.581 | -0.306 |
| 2.949955501720771 | 1.619 | 0.308 | 1.56 | -1.589 | -0.303 |
| 2.953097094374361 | 1.626 | 0.305 | 1.569 | -1.598 | -0.299 |
| 2.95623868702795 | 1.634 | 0.301 | 1.578 | -1.606 | -0.296 |
| 2.95938027968154 | 1.641 | 0.297 | 1.588 | -1.614 | -0.293 |
| 2.96252187233513 | 1.649 | 0.294 | 1.597 | -1.623 | -0.289 |
| 2.965663464988719 | 1.657 | 0.29 | 1.606 | -1.631 | -0.285 |
| 2.968805057642309 | 1.664 | 0.286 | 1.615 | -1.639 | -0.282 |
| 2.971946650295898 | 1.672 | 0.282 | 1.624 | -1.648 | -0.278 |
| 2.975088242949488 | 1.68 | 0.278 | 1.633 | -1.656 | -0.275 |
| 2.978229835603078 | 1.687 | 0.274 | 1.643 | -1.665 | -0.271 |
| 2.981371428256667 | 1.695 | 0.27 | 1.652 | -1.673 | -0.267 |
| 2.984513020910257 | 1.703 | 0.266 | 1.661 | -1.682 | -0.263 |
| 2.987654613563846 | 1.711 | 0.262 | 1.671 | -1.691 | -0.259 |
| 2.990796206217436 | 1.719 | 0.258 | 1.68 | -1.699 | -0.255 |
| 2.993937798871025 | 1.727 | 0.254 | 1.689 | -1.708 | -0.251 |
| 2.997079391524615 | 1.735 | 0.25 | 1.699 | -1.717 | -0.247 |
| 3.000220984178205 | 1.743 | 0.246 | 1.708 | -1.725 | -0.243 |
| 3.003362576831794 | 1.751 | 0.241 | 1.718 | -1.734 | -0.239 |
| 3.006504169485384 | 1.759 | 0.237 | 1.727 | -1.743 | -0.235 |
| 3.009645762138974 | 1.767 | 0.232 | 1.737 | -1.752 | -0.23 |
| 3.012787354792563 | 1.775 | 0.228 | 1.746 | -1.761 | -0.226 |
| 3.015928947446153 | 1.784 | 0.224 | 1.756 | -1.77 | -0.222 |
| 3.019070540099742 | 1.792 | 0.219 | 1.765 | -1.778 | -0.217 |
| 3.022212132753332 | 1.8 | 0.214 | 1.775 | -1.787 | -0.213 |
| 3.025353725406922 | 1.809 | 0.21 | 1.784 | -1.796 | -0.208 |
| 3.028495318060511 | 1.817 | 0.205 | 1.794 | -1.806 | -0.204 |
| 3.031636910714101 | 1.826 | 0.2 | 1.804 | -1.815 | -0.199 |
| 3.03477850336769 | 1.834 | 0.196 | 1.813 | -1.824 | -0.194 |
| 3.03792009602128 | 1.843 | 0.191 | 1.823 | -1.833 | -0.19 |
| 3.04106168867487 | 1.851 | 0.186 | 1.833 | -1.842 | -0.185 |
| 3.04420328132846 | 1.86 | 0.181 | 1.842 | -1.851 | -0.18 |
| 3.047344873982049 | 1.869 | 0.176 | 1.852 | -1.86 | -0.175 |
| 3.050486466635638 | 1.877 | 0.171 | 1.862 | -1.87 | -0.17 |
| 3.053628059289228 | 1.886 | 0.166 | 1.872 | -1.879 | -0.165 |
| 3.056769651942818 | 1.895 | 0.161 | 1.882 | -1.888 | -0.16 |
| 3.059911244596407 | 1.904 | 0.155 | 1.891 | -1.898 | -0.155 |
| 3.063052837249997 | 1.913 | 0.15 | 1.901 | -1.907 | -0.15 |
| 3.066194429903586 | 1.922 | 0.145 | 1.911 | -1.916 | -0.144 |
| 3.069336022557176 | 1.931 | 0.139 | 1.921 | -1.926 | -0.139 |
| 3.072477615210766 | 1.94 | 0.134 | 1.931 | -1.935 | -0.134 |
| 3.075619207864355 | 1.949 | 0.129 | 1.941 | -1.945 | -0.128 |
| 3.078760800517945 | 1.958 | 0.123 | 1.951 | -1.954 | -0.123 |
| 3.081902393171534 | 1.968 | 0.117 | 1.961 | -1.964 | -0.117 |
| 3.085043985825124 | 1.977 | 0.112 | 1.971 | -1.974 | -0.112 |
| 3.088185578478713 | 1.986 | 0.106 | 1.98 | -1.983 | -0.106 |
| 3.091327171132303 | 1.996 | 0.1 | 1.99 | -1.993 | -0.1 |
| 3.094468763785893 | 2.005 | 0.094 | 2 | -2.003 | -0.094 |
| 3.097610356439482 | 2.014 | 0.089 | 2.01 | -2.012 | -0.088 |
| 3.100751949093072 | 2.024 | 0.083 | 2.02 | -2.022 | -0.083 |
| 3.103893541746661 | 2.033 | 0.077 | 2.031 | -2.032 | -0.077 |
| 3.107035134400251 | 2.043 | 0.071 | 2.041 | -2.042 | -0.071 |
| 3.110176727053841 | 2.053 | 0.064 | 2.051 | -2.052 | -0.064 |
| 3.11331831970743 | 2.062 | 0.058 | 2.061 | -2.062 | -0.058 |
| 3.11645991236102 | 2.072 | 0.052 | 2.071 | -2.071 | -0.052 |
| 3.11960150501461 | 2.082 | 0.046 | 2.081 | -2.081 | -0.046 |
| 3.122743097668199 | 2.092 | 0.039 | 2.091 | -2.091 | -0.039 |
| 3.125884690321789 | 2.102 | 0.033 | 2.101 | -2.101 | -0.033 |
| 3.129026282975378 | 2.111 | 0.027 | 2.111 | -2.111 | -0.027 |
| 3.132167875628968 | 2.121 | 0.02 | 2.121 | -2.121 | -0.02 |
| 3.135309468282557 | 2.131 | 0.013 | 2.131 | -2.131 | -0.013 |
| 3.138451060936147 | 2.142 | 0.007 | 2.142 | -2.142 | -0.007 |
| 3.141592653589737 | 2.152 | 0 | 2.152 | -2.152 | 0 |
| 3.144734246243326 | 2.162 | -0.007 | 2.162 | -2.162 | 0.007 |
| 3.147875838896916 | 2.172 | -0.014 | 2.172 | -2.172 | 0.014 |
| 3.151017431550505 | 2.182 | -0.021 | 2.182 | -2.182 | 0.021 |
| 3.154159024204095 | 2.193 | -0.028 | 2.192 | -2.192 | 0.028 |
| 3.157300616857685 | 2.203 | -0.035 | 2.202 | -2.203 | 0.035 |
| 3.160442209511274 | 2.213 | -0.042 | 2.213 | -2.213 | 0.042 |
| 3.163583802164864 | 2.224 | -0.049 | 2.223 | -2.223 | 0.049 |
| 3.166725394818453 | 2.234 | -0.056 | 2.233 | -2.234 | 0.056 |
| 3.169866987472043 | 2.245 | -0.063 | 2.243 | -2.244 | 0.063 |
| 3.173008580125633 | 2.255 | -0.071 | 2.253 | -2.254 | 0.071 |
| 3.176150172779222 | 2.266 | -0.078 | 2.263 | -2.265 | 0.078 |
| 3.179291765432812 | 2.277 | -0.086 | 2.274 | -2.275 | 0.086 |
| 3.182433358086401 | 2.288 | -0.093 | 2.284 | -2.286 | 0.093 |
| 3.185574950739991 | 2.298 | -0.101 | 2.294 | -2.296 | 0.101 |
| 3.188716543393581 | 2.309 | -0.109 | 2.304 | -2.307 | 0.109 |
| 3.19185813604717 | 2.32 | -0.117 | 2.314 | -2.317 | 0.116 |
| 3.19499972870076 | 2.331 | -0.124 | 2.324 | -2.328 | 0.124 |
| 3.198141321354349 | 2.342 | -0.132 | 2.334 | -2.338 | 0.132 |
| 3.20128291400794 | 2.353 | -0.14 | 2.345 | -2.349 | 0.14 |
| 3.204424506661528 | 2.364 | -0.148 | 2.355 | -2.359 | 0.148 |
| 3.207566099315118 | 2.375 | -0.157 | 2.365 | -2.37 | 0.156 |
| 3.210707691968708 | 2.386 | -0.165 | 2.375 | -2.381 | 0.164 |
| 3.213849284622297 | 2.397 | -0.173 | 2.385 | -2.391 | 0.173 |
| 3.216990877275887 | 2.409 | -0.181 | 2.395 | -2.402 | 0.181 |
| 3.220132469929476 | 2.42 | -0.19 | 2.405 | -2.413 | 0.189 |
| 3.223274062583066 | 2.431 | -0.198 | 2.415 | -2.423 | 0.198 |
| 3.226415655236656 | 2.443 | -0.207 | 2.425 | -2.434 | 0.206 |
| 3.229557247890245 | 2.454 | -0.216 | 2.435 | -2.445 | 0.215 |
| 3.232698840543835 | 2.466 | -0.224 | 2.445 | -2.456 | 0.223 |
| 3.235840433197425 | 2.477 | -0.233 | 2.455 | -2.466 | 0.232 |
| 3.238982025851014 | 2.489 | -0.242 | 2.465 | -2.477 | 0.241 |
| 3.242123618504604 | 2.5 | -0.251 | 2.475 | -2.488 | 0.25 |
| 3.245265211158193 | 2.512 | -0.26 | 2.485 | -2.499 | 0.259 |
| 3.248406803811783 | 2.524 | -0.269 | 2.495 | -2.51 | 0.268 |
| 3.251548396465373 | 2.536 | -0.278 | 2.505 | -2.52 | 0.277 |
| 3.254689989118962 | 2.547 | -0.287 | 2.515 | -2.531 | 0.286 |
| 3.257831581772551 | 2.559 | -0.297 | 2.525 | -2.542 | 0.295 |
| 3.260973174426141 | 2.571 | -0.306 | 2.535 | -2.553 | 0.304 |
| 3.26411476707973 | 2.583 | -0.316 | 2.545 | -2.564 | 0.313 |
| 3.267256359733321 | 2.595 | -0.325 | 2.554 | -2.575 | 0.323 |
| 3.27039795238691 | 2.607 | -0.335 | 2.564 | -2.586 | 0.332 |
| 3.2735395450405 | 2.619 | -0.345 | 2.574 | -2.596 | 0.342 |
| 3.276681137694089 | 2.631 | -0.354 | 2.584 | -2.607 | 0.351 |
| 3.279822730347679 | 2.644 | -0.364 | 2.593 | -2.618 | 0.361 |
| 3.282964323001269 | 2.656 | -0.374 | 2.603 | -2.629 | 0.37 |
| 3.286105915654858 | 2.668 | -0.384 | 2.613 | -2.64 | 0.38 |
| 3.289247508308448 | 2.68 | -0.394 | 2.622 | -2.651 | 0.39 |
| 3.292389100962037 | 2.693 | -0.405 | 2.632 | -2.662 | 0.4 |
| 3.295530693615627 | 2.705 | -0.415 | 2.641 | -2.673 | 0.41 |
| 3.298672286269217 | 2.717 | -0.425 | 2.651 | -2.684 | 0.42 |
| 3.301813878922806 | 2.73 | -0.436 | 2.66 | -2.695 | 0.43 |
| 3.304955471576396 | 2.742 | -0.446 | 2.67 | -2.706 | 0.44 |
| 3.308097064229985 | 2.755 | -0.457 | 2.679 | -2.717 | 0.45 |
| 3.311238656883575 | 2.767 | -0.467 | 2.689 | -2.728 | 0.461 |
| 3.314380249537165 | 2.78 | -0.478 | 2.698 | -2.739 | 0.471 |
| 3.317521842190754 | 2.793 | -0.489 | 2.707 | -2.75 | 0.481 |
| 3.320663434844344 | 2.805 | -0.5 | 2.716 | -2.761 | 0.492 |
| 3.323805027497933 | 2.818 | -0.511 | 2.726 | -2.772 | 0.502 |
| 3.326946620151523 | 2.831 | -0.522 | 2.735 | -2.782 | 0.513 |
| 3.330088212805113 | 2.844 | -0.533 | 2.744 | -2.793 | 0.523 |
| 3.333229805458702 | 2.857 | -0.544 | 2.753 | -2.804 | 0.534 |
| 3.336371398112292 | 2.87 | -0.555 | 2.762 | -2.815 | 0.545 |
| 3.339512990765881 | 2.882 | -0.567 | 2.771 | -2.826 | 0.556 |
| 3.342654583419471 | 2.895 | -0.578 | 2.78 | -2.837 | 0.567 |
| 3.345796176073061 | 2.908 | -0.59 | 2.789 | -2.848 | 0.578 |
| 3.34893776872665 | 2.921 | -0.601 | 2.798 | -2.859 | 0.589 |
| 3.35207936138024 | 2.934 | -0.613 | 2.806 | -2.87 | 0.6 |
| 3.355220954033829 | 2.948 | -0.625 | 2.815 | -2.881 | 0.611 |
| 3.358362546687419 | 2.961 | -0.637 | 2.824 | -2.891 | 0.622 |
| 3.361504139341009 | 2.974 | -0.649 | 2.832 | -2.902 | 0.633 |
| 3.364645731994598 | 2.987 | -0.661 | 2.841 | -2.913 | 0.644 |
| 3.367787324648188 | 3 | -0.673 | 2.849 | -2.924 | 0.656 |
| 3.370928917301777 | 3.014 | -0.685 | 2.858 | -2.935 | 0.667 |
| 3.374070509955367 | 3.027 | -0.697 | 2.866 | -2.945 | 0.679 |
| 3.377212102608956 | 3.04 | -0.71 | 2.874 | -2.956 | 0.69 |
| 3.380353695262546 | 3.053 | -0.722 | 2.883 | -2.967 | 0.702 |
| 3.383495287916136 | 3.067 | -0.735 | 2.891 | -2.978 | 0.713 |
| 3.386636880569725 | 3.08 | -0.747 | 2.899 | -2.988 | 0.725 |
| 3.389778473223315 | 3.094 | -0.76 | 2.907 | -2.999 | 0.737 |
| 3.392920065876904 | 3.107 | -0.773 | 2.915 | -3.01 | 0.748 |
| 3.396061658530494 | 3.121 | -0.786 | 2.923 | -3.02 | 0.76 |
| 3.399203251184084 | 3.134 | -0.798 | 2.931 | -3.031 | 0.772 |
| 3.402344843837673 | 3.148 | -0.811 | 2.938 | -3.041 | 0.784 |
| 3.405486436491263 | 3.161 | -0.825 | 2.946 | -3.052 | 0.796 |
| 3.408628029144852 | 3.175 | -0.838 | 2.954 | -3.062 | 0.808 |
| 3.411769621798442 | 3.188 | -0.851 | 2.961 | -3.073 | 0.82 |
| 3.414911214452032 | 3.202 | -0.864 | 2.969 | -3.083 | 0.832 |
| 3.418052807105621 | 3.216 | -0.878 | 2.976 | -3.094 | 0.844 |
| 3.421194399759211 | 3.229 | -0.891 | 2.983 | -3.104 | 0.857 |
| 3.4243359924128 | 3.243 | -0.905 | 2.991 | -3.114 | 0.869 |
| 3.42747758506639 | 3.257 | -0.918 | 2.998 | -3.124 | 0.881 |
| 3.43061917771998 | 3.27 | -0.932 | 3.005 | -3.135 | 0.893 |
| 3.433760770373569 | 3.284 | -0.946 | 3.012 | -3.145 | 0.906 |
| 3.436902363027159 | 3.298 | -0.96 | 3.018 | -3.155 | 0.918 |
| 3.440043955680748 | 3.312 | -0.974 | 3.025 | -3.165 | 0.931 |
| 3.443185548334338 | 3.325 | -0.988 | 3.032 | -3.175 | 0.943 |
| 3.446327140987927 | 3.339 | -1.002 | 3.039 | -3.185 | 0.956 |
| 3.449468733641517 | 3.353 | -1.016 | 3.045 | -3.195 | 0.968 |
| 3.452610326295107 | 3.367 | -1.03 | 3.051 | -3.205 | 0.981 |
| 3.455751918948696 | 3.381 | -1.045 | 3.058 | -3.215 | 0.994 |
| 3.458893511602286 | 3.394 | -1.059 | 3.064 | -3.225 | 1.006 |
| 3.462035104255876 | 3.408 | -1.074 | 3.07 | -3.235 | 1.019 |
| 3.465176696909465 | 3.422 | -1.088 | 3.076 | -3.244 | 1.032 |
| 3.468318289563055 | 3.436 | -1.103 | 3.082 | -3.254 | 1.044 |
| 3.471459882216644 | 3.45 | -1.117 | 3.088 | -3.264 | 1.057 |
| 3.474601474870234 | 3.464 | -1.132 | 3.094 | -3.273 | 1.07 |
| 3.477743067523824 | 3.477 | -1.147 | 3.099 | -3.283 | 1.083 |
| 3.480884660177413 | 3.491 | -1.162 | 3.105 | -3.292 | 1.096 |
| 3.484026252831002 | 3.505 | -1.177 | 3.11 | -3.302 | 1.109 |
| 3.487167845484592 | 3.519 | -1.192 | 3.115 | -3.311 | 1.122 |
| 3.490309438138182 | 3.533 | -1.207 | 3.12 | -3.32 | 1.135 |
| 3.493451030791772 | 3.547 | -1.222 | 3.126 | -3.33 | 1.147 |
| 3.496592623445361 | 3.561 | -1.238 | 3.13 | -3.339 | 1.16 |
| 3.499734216098951 | 3.575 | -1.253 | 3.135 | -3.348 | 1.173 |
| 3.50287580875254 | 3.588 | -1.268 | 3.14 | -3.357 | 1.187 |
| 3.50601740140613 | 3.602 | -1.284 | 3.145 | -3.366 | 1.2 |
| 3.50915899405972 | 3.616 | -1.299 | 3.149 | -3.374 | 1.213 |
| 3.512300586713309 | 3.63 | -1.315 | 3.153 | -3.383 | 1.226 |
| 3.515442179366899 | 3.644 | -1.331 | 3.158 | -3.392 | 1.239 |
| 3.518583772020488 | 3.657 | -1.346 | 3.162 | -3.401 | 1.252 |
| 3.521725364674078 | 3.671 | -1.362 | 3.166 | -3.409 | 1.265 |
| 3.524866957327668 | 3.685 | -1.378 | 3.17 | -3.418 | 1.278 |
| 3.528008549981257 | 3.699 | -1.394 | 3.173 | -3.426 | 1.291 |
| 3.531150142634847 | 3.712 | -1.41 | 3.177 | -3.434 | 1.304 |
| 3.534291735288436 | 3.726 | -1.426 | 3.18 | -3.443 | 1.317 |
| 3.537433327942026 | 3.74 | -1.442 | 3.184 | -3.451 | 1.331 |
| 3.540574920595616 | 3.754 | -1.458 | 3.187 | -3.459 | 1.344 |
| 3.543716513249205 | 3.767 | -1.474 | 3.19 | -3.467 | 1.357 |
| 3.546858105902795 | 3.781 | -1.491 | 3.193 | -3.475 | 1.37 |
| 3.549999698556384 | 3.794 | -1.507 | 3.196 | -3.482 | 1.383 |
| 3.553141291209974 | 3.808 | -1.523 | 3.199 | -3.49 | 1.396 |
| 3.556282883863564 | 3.822 | -1.54 | 3.201 | -3.498 | 1.409 |
| 3.559424476517153 | 3.835 | -1.556 | 3.204 | -3.505 | 1.422 |
| 3.562566069170743 | 3.849 | -1.573 | 3.206 | -3.513 | 1.435 |
| 3.565707661824332 | 3.862 | -1.589 | 3.208 | -3.52 | 1.448 |
| 3.568849254477922 | 3.875 | -1.606 | 3.21 | -3.527 | 1.462 |
| 3.571990847131511 | 3.889 | -1.623 | 3.212 | -3.534 | 1.475 |
| 3.575132439785101 | 3.902 | -1.639 | 3.214 | -3.541 | 1.488 |
| 3.578274032438691 | 3.915 | -1.656 | 3.215 | -3.548 | 1.501 |
| 3.58141562509228 | 3.929 | -1.673 | 3.216 | -3.555 | 1.514 |
| 3.58455721774587 | 3.942 | -1.69 | 3.218 | -3.561 | 1.527 |
| 3.58769881039946 | 3.955 | -1.706 | 3.219 | -3.568 | 1.539 |
| 3.590840403053049 | 3.968 | -1.723 | 3.22 | -3.575 | 1.552 |
| 3.593981995706639 | 3.981 | -1.74 | 3.221 | -3.581 | 1.565 |
| 3.597123588360228 | 3.994 | -1.757 | 3.221 | -3.587 | 1.578 |
| 3.600265181013818 | 4.007 | -1.774 | 3.222 | -3.593 | 1.591 |
| 3.603406773667407 | 4.02 | -1.791 | 3.222 | -3.599 | 1.604 |
| 3.606548366320997 | 4.033 | -1.808 | 3.222 | -3.605 | 1.616 |
| 3.609689958974587 | 4.046 | -1.826 | 3.222 | -3.611 | 1.629 |
| 3.612831551628176 | 4.059 | -1.843 | 3.222 | -3.617 | 1.642 |
| 3.615973144281766 | 4.072 | -1.86 | 3.222 | -3.622 | 1.654 |
| 3.619114736935355 | 4.084 | -1.877 | 3.222 | -3.627 | 1.667 |
| 3.622256329588945 | 4.097 | -1.894 | 3.221 | -3.633 | 1.68 |
| 3.625397922242534 | 4.109 | -1.912 | 3.22 | -3.638 | 1.692 |
| 3.628539514896124 | 4.122 | -1.929 | 3.219 | -3.643 | 1.705 |
| 3.631681107549714 | 4.134 | -1.946 | 3.218 | -3.648 | 1.717 |
| 3.634822700203303 | 4.147 | -1.963 | 3.217 | -3.652 | 1.729 |
| 3.637964292856893 | 4.159 | -1.981 | 3.216 | -3.657 | 1.742 |
| 3.641105885510483 | 4.171 | -1.998 | 3.214 | -3.662 | 1.754 |
| 3.644247478164072 | 4.183 | -2.015 | 3.213 | -3.666 | 1.766 |
| 3.647389070817662 | 4.196 | -2.033 | 3.211 | -3.67 | 1.778 |
| 3.650530663471251 | 4.208 | -2.05 | 3.209 | -3.674 | 1.79 |
| 3.653672256124841 | 4.219 | -2.067 | 3.206 | -3.678 | 1.802 |
| 3.656813848778431 | 4.231 | -2.085 | 3.204 | -3.682 | 1.814 |
| 3.65995544143202 | 4.243 | -2.102 | 3.201 | -3.686 | 1.826 |
| 3.66309703408561 | 4.255 | -2.12 | 3.199 | -3.689 | 1.838 |
| 3.666238626739199 | 4.266 | -2.137 | 3.196 | -3.693 | 1.85 |
| 3.66938021939279 | 4.278 | -2.154 | 3.193 | -3.696 | 1.861 |
| 3.672521812046378 | 4.289 | -2.172 | 3.19 | -3.699 | 1.873 |
| 3.675663404699968 | 4.301 | -2.189 | 3.186 | -3.702 | 1.884 |
| 3.678804997353558 | 4.312 | -2.207 | 3.183 | -3.705 | 1.896 |
| 3.681946590007147 | 4.323 | -2.224 | 3.179 | -3.707 | 1.907 |
| 3.685088182660737 | 4.334 | -2.241 | 3.175 | -3.71 | 1.918 |
| 3.688229775314326 | 4.345 | -2.259 | 3.171 | -3.712 | 1.93 |
| 3.691371367967916 | 4.356 | -2.276 | 3.167 | -3.714 | 1.941 |
| 3.694512960621506 | 4.367 | -2.293 | 3.162 | -3.716 | 1.952 |
| 3.697654553275095 | 4.378 | -2.311 | 3.158 | -3.718 | 1.963 |
| 3.700796145928685 | 4.388 | -2.328 | 3.153 | -3.72 | 1.973 |
| 3.703937738582274 | 4.399 | -2.345 | 3.148 | -3.721 | 1.984 |
| 3.707079331235864 | 4.409 | -2.363 | 3.143 | -3.723 | 1.995 |
| 3.710220923889454 | 4.419 | -2.38 | 3.138 | -3.724 | 2.005 |
| 3.713362516543043 | 4.43 | -2.397 | 3.133 | -3.725 | 2.016 |
| 3.716504109196633 | 4.44 | -2.414 | 3.127 | -3.726 | 2.026 |
| 3.719645701850223 | 4.45 | -2.431 | 3.121 | -3.727 | 2.036 |
| 3.722787294503812 | 4.459 | -2.448 | 3.115 | -3.727 | 2.046 |
| 3.725928887157402 | 4.469 | -2.465 | 3.109 | -3.728 | 2.056 |
| 3.729070479810991 | 4.479 | -2.482 | 3.103 | -3.728 | 2.066 |
| 3.732212072464581 | 4.488 | -2.499 | 3.096 | -3.728 | 2.076 |
| 3.735353665118171 | 4.498 | -2.516 | 3.09 | -3.728 | 2.086 |
| 3.73849525777176 | 4.507 | -2.533 | 3.083 | -3.728 | 2.095 |
| 3.74163685042535 | 4.516 | -2.55 | 3.076 | -3.727 | 2.105 |
| 3.744778443078939 | 4.525 | -2.567 | 3.069 | -3.727 | 2.114 |
| 3.747920035732529 | 4.534 | -2.584 | 3.062 | -3.726 | 2.123 |
| 3.751061628386119 | 4.543 | -2.6 | 3.054 | -3.725 | 2.132 |
| 3.754203221039708 | 4.552 | -2.617 | 3.047 | -3.724 | 2.141 |
| 3.757344813693298 | 4.56 | -2.634 | 3.039 | -3.723 | 2.15 |
| 3.760486406346887 | 4.568 | -2.65 | 3.031 | -3.721 | 2.159 |
| 3.763627999000477 | 4.577 | -2.667 | 3.023 | -3.719 | 2.167 |
| 3.766769591654067 | 4.585 | -2.683 | 3.015 | -3.718 | 2.176 |
| 3.769911184307656 | 4.593 | -2.7 | 3.006 | -3.716 | 2.184 |
| 3.773052776961246 | 4.601 | -2.716 | 2.997 | -3.714 | 2.192 |
| 3.776194369614835 | 4.608 | -2.732 | 2.989 | -3.711 | 2.2 |
| 3.779335962268425 | 4.616 | -2.748 | 2.98 | -3.709 | 2.208 |
| 3.782477554922014 | 4.624 | -2.764 | 2.971 | -3.706 | 2.216 |
| 3.785619147575604 | 4.631 | -2.78 | 2.961 | -3.703 | 2.223 |
| 3.788760740229193 | 4.638 | -2.796 | 2.952 | -3.7 | 2.231 |
| 3.791902332882783 | 4.645 | -2.812 | 2.942 | -3.697 | 2.238 |
| 3.795043925536373 | 4.652 | -2.828 | 2.933 | -3.694 | 2.245 |
| 3.798185518189962 | 4.659 | -2.844 | 2.923 | -3.69 | 2.252 |
| 3.801327110843552 | 4.665 | -2.859 | 2.913 | -3.686 | 2.259 |
| 3.804468703497142 | 4.672 | -2.875 | 2.903 | -3.682 | 2.266 |
| 3.807610296150731 | 4.678 | -2.89 | 2.892 | -3.678 | 2.273 |
| 3.810751888804321 | 4.684 | -2.906 | 2.882 | -3.674 | 2.279 |
| 3.813893481457911 | 4.69 | -2.921 | 2.871 | -3.67 | 2.285 |
| 3.8170350741115 | 4.696 | -2.936 | 2.86 | -3.665 | 2.291 |
| 3.82017666676509 | 4.702 | -2.951 | 2.849 | -3.66 | 2.297 |
| 3.823318259418679 | 4.707 | -2.966 | 2.838 | -3.655 | 2.303 |
| 3.826459852072269 | 4.713 | -2.981 | 2.827 | -3.65 | 2.309 |
| 3.829601444725859 | 4.718 | -2.996 | 2.816 | -3.645 | 2.314 |
| 3.832743037379448 | 4.723 | -3.011 | 2.804 | -3.639 | 2.32 |
| 3.835884630033038 | 4.728 | -3.025 | 2.792 | -3.633 | 2.325 |
| 3.839026222686627 | 4.733 | -3.04 | 2.781 | -3.628 | 2.33 |
| 3.842167815340217 | 4.737 | -3.054 | 2.769 | -3.622 | 2.335 |
| 3.845309407993807 | 4.742 | -3.068 | 2.756 | -3.615 | 2.339 |
| 3.848451000647396 | 4.746 | -3.082 | 2.744 | -3.609 | 2.344 |
| 3.851592593300986 | 4.75 | -3.096 | 2.732 | -3.602 | 2.348 |
| 3.854734185954575 | 4.754 | -3.11 | 2.719 | -3.596 | 2.352 |
| 3.857875778608165 | 4.758 | -3.124 | 2.707 | -3.589 | 2.356 |
| 3.861017371261755 | 4.762 | -3.138 | 2.694 | -3.582 | 2.36 |
| 3.864158963915344 | 4.765 | -3.151 | 2.681 | -3.574 | 2.364 |
| 3.867300556568933 | 4.768 | -3.165 | 2.668 | -3.567 | 2.367 |
| 3.870442149222523 | 4.772 | -3.178 | 2.655 | -3.559 | 2.371 |
| 3.873583741876112 | 4.774 | -3.191 | 2.642 | -3.551 | 2.374 |
| 3.876725334529703 | 4.777 | -3.204 | 2.628 | -3.544 | 2.377 |
| 3.879866927183292 | 4.78 | -3.217 | 2.615 | -3.535 | 2.379 |
| 3.883008519836882 | 4.782 | -3.23 | 2.601 | -3.527 | 2.382 |
| 3.886150112490471 | 4.785 | -3.242 | 2.588 | -3.519 | 2.384 |
| 3.889291705144061 | 4.787 | -3.255 | 2.574 | -3.51 | 2.387 |
| 3.892433297797651 | 4.789 | -3.267 | 2.56 | -3.501 | 2.389 |
| 3.89557489045124 | 4.791 | -3.279 | 2.546 | -3.492 | 2.391 |
| 3.89871648310483 | 4.792 | -3.291 | 2.532 | -3.483 | 2.392 |
| 3.901858075758419 | 4.794 | -3.303 | 2.517 | -3.474 | 2.394 |
| 3.904999668412009 | 4.795 | -3.315 | 2.503 | -3.464 | 2.395 |
| 3.908141261065598 | 4.796 | -3.327 | 2.488 | -3.455 | 2.396 |
| 3.911282853719188 | 4.797 | -3.338 | 2.474 | -3.445 | 2.397 |
| 3.914424446372778 | 4.798 | -3.35 | 2.459 | -3.435 | 2.398 |
| 3.917566039026367 | 4.798 | -3.361 | 2.444 | -3.425 | 2.399 |
| 3.920707631679957 | 4.799 | -3.372 | 2.43 | -3.415 | 2.399 |
| 3.923849224333547 | 4.799 | -3.383 | 2.415 | -3.404 | 2.399 |
| 3.926990816987136 | 4.799 | -3.394 | 2.4 | -3.394 | 2.4 |
| 3.930132409640726 | 4.799 | -3.404 | 2.384 | -3.383 | 2.399 |
| 3.933274002294315 | 4.799 | -3.415 | 2.369 | -3.372 | 2.399 |
| 3.936415594947905 | 4.798 | -3.425 | 2.354 | -3.361 | 2.399 |
| 3.939557187601495 | 4.798 | -3.435 | 2.339 | -3.35 | 2.398 |
| 3.942698780255084 | 4.797 | -3.445 | 2.323 | -3.338 | 2.397 |
| 3.945840372908674 | 4.796 | -3.455 | 2.308 | -3.327 | 2.396 |
| 3.948981965562263 | 4.795 | -3.464 | 2.292 | -3.315 | 2.395 |
| 3.952123558215853 | 4.794 | -3.474 | 2.276 | -3.303 | 2.394 |
| 3.955265150869442 | 4.792 | -3.483 | 2.261 | -3.291 | 2.392 |
| 3.958406743523032 | 4.791 | -3.492 | 2.245 | -3.279 | 2.391 |
| 3.961548336176622 | 4.789 | -3.501 | 2.229 | -3.267 | 2.389 |
| 3.964689928830211 | 4.787 | -3.51 | 2.213 | -3.255 | 2.387 |
| 3.967831521483801 | 4.785 | -3.519 | 2.197 | -3.242 | 2.384 |
| 3.97097311413739 | 4.782 | -3.527 | 2.181 | -3.23 | 2.382 |
| 3.97411470679098 | 4.78 | -3.535 | 2.165 | -3.217 | 2.379 |
| 3.97725629944457 | 4.777 | -3.544 | 2.149 | -3.204 | 2.377 |
| 3.98039789209816 | 4.774 | -3.551 | 2.133 | -3.191 | 2.374 |
| 3.983539484751749 | 4.772 | -3.559 | 2.117 | -3.178 | 2.371 |
| 3.986681077405338 | 4.768 | -3.567 | 2.1 | -3.165 | 2.367 |
| 3.989822670058928 | 4.765 | -3.574 | 2.084 | -3.151 | 2.364 |
| 3.992964262712517 | 4.762 | -3.582 | 2.068 | -3.138 | 2.36 |
| 3.996105855366107 | 4.758 | -3.589 | 2.051 | -3.124 | 2.356 |
| 3.999247448019697 | 4.754 | -3.596 | 2.035 | -3.11 | 2.352 |
| 4.002389040673287 | 4.75 | -3.602 | 2.018 | -3.096 | 2.348 |
| 4.005530633326877 | 4.746 | -3.609 | 2.002 | -3.082 | 2.344 |
| 4.008672225980466 | 4.742 | -3.615 | 1.985 | -3.068 | 2.339 |
| 4.011813818634056 | 4.737 | -3.622 | 1.969 | -3.054 | 2.335 |
| 4.014955411287645 | 4.733 | -3.628 | 1.952 | -3.04 | 2.33 |
| 4.018097003941234 | 4.728 | -3.633 | 1.936 | -3.025 | 2.325 |
| 4.021238596594824 | 4.723 | -3.639 | 1.919 | -3.011 | 2.32 |
| 4.024380189248414 | 4.718 | -3.645 | 1.902 | -2.996 | 2.314 |
| 4.027521781902004 | 4.713 | -3.65 | 1.886 | -2.981 | 2.309 |
| 4.030663374555593 | 4.707 | -3.655 | 1.869 | -2.966 | 2.303 |
| 4.033804967209183 | 4.702 | -3.66 | 1.852 | -2.951 | 2.297 |
| 4.036946559862773 | 4.696 | -3.665 | 1.836 | -2.936 | 2.291 |
| 4.040088152516362 | 4.69 | -3.67 | 1.819 | -2.921 | 2.285 |
| 4.043229745169951 | 4.684 | -3.674 | 1.803 | -2.906 | 2.279 |
| 4.046371337823541 | 4.678 | -3.678 | 1.786 | -2.89 | 2.273 |
| 4.049512930477131 | 4.672 | -3.682 | 1.769 | -2.875 | 2.266 |
| 4.05265452313072 | 4.665 | -3.686 | 1.753 | -2.859 | 2.259 |
| 4.05579611578431 | 4.659 | -3.69 | 1.736 | -2.844 | 2.252 |
| 4.0589377084379 | 4.652 | -3.694 | 1.719 | -2.828 | 2.245 |
| 4.062079301091489 | 4.645 | -3.697 | 1.703 | -2.812 | 2.238 |
| 4.065220893745079 | 4.638 | -3.7 | 1.686 | -2.796 | 2.231 |
| 4.068362486398668 | 4.631 | -3.703 | 1.669 | -2.78 | 2.223 |
| 4.071504079052258 | 4.624 | -3.706 | 1.653 | -2.764 | 2.216 |
| 4.074645671705848 | 4.616 | -3.709 | 1.636 | -2.748 | 2.208 |
| 4.077787264359437 | 4.608 | -3.711 | 1.62 | -2.732 | 2.2 |
| 4.080928857013027 | 4.601 | -3.714 | 1.603 | -2.716 | 2.192 |
| 4.084070449666616 | 4.593 | -3.716 | 1.587 | -2.7 | 2.184 |
| 4.087212042320206 | 4.585 | -3.718 | 1.57 | -2.683 | 2.176 |
| 4.090353634973795 | 4.577 | -3.719 | 1.554 | -2.667 | 2.167 |
| 4.093495227627385 | 4.568 | -3.721 | 1.538 | -2.65 | 2.159 |
| 4.096636820280975 | 4.56 | -3.723 | 1.521 | -2.634 | 2.15 |
| 4.099778412934564 | 4.552 | -3.724 | 1.505 | -2.617 | 2.141 |
| 4.102920005588154 | 4.543 | -3.725 | 1.489 | -2.6 | 2.132 |
| 4.106061598241744 | 4.534 | -3.726 | 1.472 | -2.584 | 2.123 |
| 4.109203190895333 | 4.525 | -3.727 | 1.456 | -2.567 | 2.114 |
| 4.112344783548923 | 4.516 | -3.727 | 1.44 | -2.55 | 2.105 |
| 4.115486376202512 | 4.507 | -3.728 | 1.424 | -2.533 | 2.095 |
| 4.118627968856102 | 4.498 | -3.728 | 1.408 | -2.516 | 2.086 |
| 4.121769561509692 | 4.488 | -3.728 | 1.392 | -2.499 | 2.076 |
| 4.124911154163281 | 4.479 | -3.728 | 1.376 | -2.482 | 2.066 |
| 4.128052746816871 | 4.469 | -3.728 | 1.36 | -2.465 | 2.056 |
| 4.13119433947046 | 4.459 | -3.727 | 1.344 | -2.448 | 2.046 |
| 4.13433593212405 | 4.45 | -3.727 | 1.328 | -2.431 | 2.036 |
| 4.13747752477764 | 4.44 | -3.726 | 1.313 | -2.414 | 2.026 |
| 4.14061911743123 | 4.43 | -3.725 | 1.297 | -2.397 | 2.016 |
| 4.143760710084818 | 4.419 | -3.724 | 1.281 | -2.38 | 2.005 |
| 4.146902302738408 | 4.409 | -3.723 | 1.266 | -2.363 | 1.995 |
| 4.150043895391998 | 4.399 | -3.721 | 1.25 | -2.345 | 1.984 |
| 4.153185488045588 | 4.388 | -3.72 | 1.235 | -2.328 | 1.973 |
| 4.156327080699177 | 4.378 | -3.718 | 1.22 | -2.311 | 1.963 |
| 4.159468673352766 | 4.367 | -3.716 | 1.204 | -2.293 | 1.952 |
| 4.162610266006356 | 4.356 | -3.714 | 1.189 | -2.276 | 1.941 |
| 4.165751858659946 | 4.345 | -3.712 | 1.174 | -2.259 | 1.93 |
| 4.168893451313535 | 4.334 | -3.71 | 1.159 | -2.241 | 1.918 |
| 4.172035043967125 | 4.323 | -3.707 | 1.144 | -2.224 | 1.907 |
| 4.175176636620715 | 4.312 | -3.705 | 1.129 | -2.207 | 1.896 |
| 4.178318229274304 | 4.301 | -3.702 | 1.114 | -2.189 | 1.884 |
| 4.181459821927894 | 4.289 | -3.699 | 1.1 | -2.172 | 1.873 |
| 4.184601414581484 | 4.278 | -3.696 | 1.085 | -2.154 | 1.861 |
| 4.187743007235073 | 4.266 | -3.693 | 1.07 | -2.137 | 1.85 |
| 4.190884599888663 | 4.255 | -3.689 | 1.056 | -2.12 | 1.838 |
| 4.194026192542252 | 4.243 | -3.686 | 1.042 | -2.102 | 1.826 |
| 4.197167785195842 | 4.231 | -3.682 | 1.027 | -2.085 | 1.814 |
| 4.200309377849432 | 4.219 | -3.678 | 1.013 | -2.067 | 1.802 |
| 4.203450970503021 | 4.208 | -3.674 | 0.999 | -2.05 | 1.79 |
| 4.206592563156611 | 4.196 | -3.67 | 0.985 | -2.033 | 1.778 |
| 4.2097341558102 | 4.183 | -3.666 | 0.971 | -2.015 | 1.766 |
| 4.21287574846379 | 4.171 | -3.662 | 0.957 | -1.998 | 1.754 |
| 4.21601734111738 | 4.159 | -3.657 | 0.943 | -1.981 | 1.742 |
| 4.21915893377097 | 4.147 | -3.652 | 0.93 | -1.963 | 1.729 |
| 4.222300526424559 | 4.134 | -3.648 | 0.916 | -1.946 | 1.717 |
| 4.225442119078148 | 4.122 | -3.643 | 0.903 | -1.929 | 1.705 |
| 4.228583711731738 | 4.109 | -3.638 | 0.889 | -1.912 | 1.692 |
| 4.231725304385327 | 4.097 | -3.633 | 0.876 | -1.894 | 1.68 |
| 4.234866897038917 | 4.084 | -3.627 | 0.863 | -1.877 | 1.667 |
| 4.238008489692506 | 4.072 | -3.622 | 0.85 | -1.86 | 1.654 |
| 4.241150082346096 | 4.059 | -3.617 | 0.837 | -1.843 | 1.642 |
| 4.244291674999685 | 4.046 | -3.611 | 0.824 | -1.826 | 1.629 |
| 4.247433267653276 | 4.033 | -3.605 | 0.811 | -1.808 | 1.616 |
| 4.250574860306865 | 4.02 | -3.599 | 0.798 | -1.791 | 1.604 |
| 4.253716452960455 | 4.007 | -3.593 | 0.786 | -1.774 | 1.591 |
| 4.256858045614044 | 3.994 | -3.587 | 0.773 | -1.757 | 1.578 |
| 4.259999638267634 | 3.981 | -3.581 | 0.761 | -1.74 | 1.565 |
| 4.263141230921224 | 3.968 | -3.575 | 0.748 | -1.723 | 1.552 |
| 4.266282823574813 | 3.955 | -3.568 | 0.736 | -1.706 | 1.539 |
| 4.269424416228403 | 3.942 | -3.561 | 0.724 | -1.69 | 1.527 |
| 4.272566008881992 | 3.929 | -3.555 | 0.712 | -1.673 | 1.514 |
| 4.275707601535582 | 3.915 | -3.548 | 0.7 | -1.656 | 1.501 |
| 4.27884919418917 | 3.902 | -3.541 | 0.689 | -1.639 | 1.488 |
| 4.28199078684276 | 3.889 | -3.534 | 0.677 | -1.623 | 1.475 |
| 4.285132379496351 | 3.875 | -3.527 | 0.665 | -1.606 | 1.462 |
| 4.28827397214994 | 3.862 | -3.52 | 0.654 | -1.589 | 1.448 |
| 4.29141556480353 | 3.849 | -3.513 | 0.643 | -1.573 | 1.435 |
| 4.294557157457119 | 3.835 | -3.505 | 0.631 | -1.556 | 1.422 |
| 4.29769875011071 | 3.822 | -3.498 | 0.62 | -1.54 | 1.409 |
| 4.300840342764299 | 3.808 | -3.49 | 0.609 | -1.523 | 1.396 |
| 4.303981935417888 | 3.794 | -3.482 | 0.598 | -1.507 | 1.383 |
| 4.307123528071478 | 3.781 | -3.475 | 0.588 | -1.491 | 1.37 |
| 4.310265120725067 | 3.767 | -3.467 | 0.577 | -1.474 | 1.357 |
| 4.313406713378657 | 3.754 | -3.459 | 0.566 | -1.458 | 1.344 |
| 4.316548306032247 | 3.74 | -3.451 | 0.556 | -1.442 | 1.331 |
| 4.319689898685836 | 3.726 | -3.443 | 0.546 | -1.426 | 1.317 |
| 4.322831491339426 | 3.712 | -3.434 | 0.535 | -1.41 | 1.304 |
| 4.325973083993015 | 3.699 | -3.426 | 0.525 | -1.394 | 1.291 |
| 4.329114676646605 | 3.685 | -3.418 | 0.515 | -1.378 | 1.278 |
| 4.332256269300195 | 3.671 | -3.409 | 0.505 | -1.362 | 1.265 |
| 4.335397861953784 | 3.657 | -3.401 | 0.496 | -1.346 | 1.252 |
| 4.338539454607374 | 3.644 | -3.392 | 0.486 | -1.331 | 1.239 |
| 4.341681047260963 | 3.63 | -3.383 | 0.476 | -1.315 | 1.226 |
| 4.344822639914553 | 3.616 | -3.374 | 0.467 | -1.299 | 1.213 |
| 4.347964232568143 | 3.602 | -3.366 | 0.458 | -1.284 | 1.2 |
| 4.351105825221732 | 3.588 | -3.357 | 0.448 | -1.268 | 1.187 |
| 4.354247417875322 | 3.575 | -3.348 | 0.439 | -1.253 | 1.173 |
| 4.357389010528911 | 3.561 | -3.339 | 0.43 | -1.238 | 1.16 |
| 4.360530603182501 | 3.547 | -3.33 | 0.421 | -1.222 | 1.147 |
| 4.36367219583609 | 3.533 | -3.32 | 0.412 | -1.207 | 1.135 |
| 4.36681378848968 | 3.519 | -3.311 | 0.404 | -1.192 | 1.122 |
| 4.36995538114327 | 3.505 | -3.302 | 0.395 | -1.177 | 1.109 |
| 4.373096973796859 | 3.491 | -3.292 | 0.387 | -1.162 | 1.096 |
| 4.376238566450449 | 3.477 | -3.283 | 0.378 | -1.147 | 1.083 |
| 4.379380159104038 | 3.464 | -3.273 | 0.37 | -1.132 | 1.07 |
| 4.382521751757628 | 3.45 | -3.264 | 0.362 | -1.117 | 1.057 |
| 4.385663344411217 | 3.436 | -3.254 | 0.354 | -1.103 | 1.044 |
| 4.388804937064807 | 3.422 | -3.244 | 0.346 | -1.088 | 1.032 |
| 4.391946529718397 | 3.408 | -3.235 | 0.338 | -1.074 | 1.019 |
| 4.395088122371987 | 3.394 | -3.225 | 0.33 | -1.059 | 1.006 |
| 4.398229715025576 | 3.381 | -3.215 | 0.323 | -1.045 | 0.994 |
| 4.401371307679165 | 3.367 | -3.205 | 0.315 | -1.03 | 0.981 |
| 4.404512900332755 | 3.353 | -3.195 | 0.308 | -1.016 | 0.968 |
| 4.407654492986345 | 3.339 | -3.185 | 0.301 | -1.002 | 0.956 |
| 4.410796085639934 | 3.325 | -3.175 | 0.293 | -0.988 | 0.943 |
| 4.413937678293524 | 3.312 | -3.165 | 0.286 | -0.974 | 0.931 |
| 4.417079270947114 | 3.298 | -3.155 | 0.279 | -0.96 | 0.918 |
| 4.420220863600703 | 3.284 | -3.145 | 0.272 | -0.946 | 0.906 |
| 4.423362456254293 | 3.27 | -3.135 | 0.266 | -0.932 | 0.893 |
| 4.426504048907883 | 3.257 | -3.124 | 0.259 | -0.918 | 0.881 |
| 4.429645641561472 | 3.243 | -3.114 | 0.252 | -0.905 | 0.869 |
| 4.432787234215062 | 3.229 | -3.104 | 0.246 | -0.891 | 0.857 |
| 4.435928826868651 | 3.216 | -3.094 | 0.24 | -0.878 | 0.844 |
| 4.43907041952224 | 3.202 | -3.083 | 0.233 | -0.864 | 0.832 |
| 4.44221201217583 | 3.188 | -3.073 | 0.227 | -0.851 | 0.82 |
| 4.44535360482942 | 3.175 | -3.062 | 0.221 | -0.838 | 0.808 |
| 4.44849519748301 | 3.161 | -3.052 | 0.215 | -0.825 | 0.796 |
| 4.4516367901366 | 3.148 | -3.041 | 0.209 | -0.811 | 0.784 |
| 4.454778382790188 | 3.134 | -3.031 | 0.203 | -0.798 | 0.772 |
| 4.457919975443779 | 3.121 | -3.02 | 0.198 | -0.786 | 0.76 |
| 4.461061568097368 | 3.107 | -3.01 | 0.192 | -0.773 | 0.748 |
| 4.464203160750958 | 3.094 | -2.999 | 0.187 | -0.76 | 0.737 |
| 4.467344753404547 | 3.08 | -2.988 | 0.181 | -0.747 | 0.725 |
| 4.470486346058137 | 3.067 | -2.978 | 0.176 | -0.735 | 0.713 |
| 4.473627938711726 | 3.053 | -2.967 | 0.171 | -0.722 | 0.702 |
| 4.476769531365316 | 3.04 | -2.956 | 0.166 | -0.71 | 0.69 |
| 4.479911124018905 | 3.027 | -2.945 | 0.161 | -0.697 | 0.679 |
| 4.483052716672495 | 3.014 | -2.935 | 0.156 | -0.685 | 0.667 |
| 4.486194309326085 | 3 | -2.924 | 0.151 | -0.673 | 0.656 |
| 4.489335901979674 | 2.987 | -2.913 | 0.146 | -0.661 | 0.644 |
| 4.492477494633264 | 2.974 | -2.902 | 0.142 | -0.649 | 0.633 |
| 4.495619087286854 | 2.961 | -2.891 | 0.137 | -0.637 | 0.622 |
| 4.498760679940443 | 2.948 | -2.881 | 0.132 | -0.625 | 0.611 |
| 4.501902272594033 | 2.934 | -2.87 | 0.128 | -0.613 | 0.6 |
| 4.505043865247622 | 2.921 | -2.859 | 0.124 | -0.601 | 0.589 |
| 4.508185457901212 | 2.908 | -2.848 | 0.12 | -0.59 | 0.578 |
| 4.511327050554801 | 2.895 | -2.837 | 0.115 | -0.578 | 0.567 |
| 4.514468643208391 | 2.882 | -2.826 | 0.111 | -0.567 | 0.556 |
| 4.517610235861981 | 2.87 | -2.815 | 0.107 | -0.555 | 0.545 |
| 4.520751828515571 | 2.857 | -2.804 | 0.104 | -0.544 | 0.534 |
| 4.52389342116916 | 2.844 | -2.793 | 0.1 | -0.533 | 0.523 |
| 4.52703501382275 | 2.831 | -2.782 | 0.096 | -0.522 | 0.513 |
| 4.530176606476339 | 2.818 | -2.772 | 0.093 | -0.511 | 0.502 |
| 4.533318199129928 | 2.805 | -2.761 | 0.089 | -0.5 | 0.492 |
| 4.536459791783518 | 2.793 | -2.75 | 0.086 | -0.489 | 0.481 |
| 4.539601384437108 | 2.78 | -2.739 | 0.082 | -0.478 | 0.471 |
| 4.542742977090698 | 2.767 | -2.728 | 0.079 | -0.467 | 0.461 |
| 4.545884569744287 | 2.755 | -2.717 | 0.076 | -0.457 | 0.45 |
| 4.549026162397876 | 2.742 | -2.706 | 0.073 | -0.446 | 0.44 |
| 4.552167755051466 | 2.73 | -2.695 | 0.069 | -0.436 | 0.43 |
| 4.555309347705056 | 2.717 | -2.684 | 0.066 | -0.425 | 0.42 |
| 4.558450940358646 | 2.705 | -2.673 | 0.064 | -0.415 | 0.41 |
| 4.561592533012235 | 2.693 | -2.662 | 0.061 | -0.405 | 0.4 |
| 4.564734125665825 | 2.68 | -2.651 | 0.058 | -0.394 | 0.39 |
| 4.567875718319415 | 2.668 | -2.64 | 0.055 | -0.384 | 0.38 |
| 4.571017310973004 | 2.656 | -2.629 | 0.053 | -0.374 | 0.37 |
| 4.574158903626594 | 2.644 | -2.618 | 0.05 | -0.364 | 0.361 |
| 4.577300496280183 | 2.631 | -2.607 | 0.048 | -0.354 | 0.351 |
| 4.580442088933772 | 2.619 | -2.596 | 0.045 | -0.345 | 0.342 |
| 4.583583681587362 | 2.607 | -2.586 | 0.043 | -0.335 | 0.332 |
| 4.586725274240952 | 2.595 | -2.575 | 0.041 | -0.325 | 0.323 |
| 4.589866866894542 | 2.583 | -2.564 | 0.039 | -0.316 | 0.313 |
| 4.593008459548131 | 2.571 | -2.553 | 0.036 | -0.306 | 0.304 |
| 4.596150052201721 | 2.559 | -2.542 | 0.034 | -0.297 | 0.295 |
| 4.59929164485531 | 2.547 | -2.531 | 0.032 | -0.287 | 0.286 |
| 4.6024332375089 | 2.536 | -2.52 | 0.031 | -0.278 | 0.277 |
| 4.60557483016249 | 2.524 | -2.51 | 0.029 | -0.269 | 0.268 |
| 4.608716422816079 | 2.512 | -2.499 | 0.027 | -0.26 | 0.259 |
| 4.611858015469668 | 2.5 | -2.488 | 0.025 | -0.251 | 0.25 |
| 4.614999608123258 | 2.489 | -2.477 | 0.024 | -0.242 | 0.241 |
| 4.618141200776848 | 2.477 | -2.466 | 0.022 | -0.233 | 0.232 |
| 4.621282793430437 | 2.466 | -2.456 | 0.02 | -0.224 | 0.223 |
| 4.624424386084027 | 2.454 | -2.445 | 0.019 | -0.216 | 0.215 |
| 4.627565978737617 | 2.443 | -2.434 | 0.018 | -0.207 | 0.206 |
| 4.630707571391206 | 2.431 | -2.423 | 0.016 | -0.198 | 0.198 |
| 4.633849164044795 | 2.42 | -2.413 | 0.015 | -0.19 | 0.189 |
| 4.636990756698386 | 2.409 | -2.402 | 0.014 | -0.181 | 0.181 |
| 4.640132349351975 | 2.397 | -2.391 | 0.012 | -0.173 | 0.173 |
| 4.643273942005564 | 2.386 | -2.381 | 0.011 | -0.165 | 0.164 |
| 4.646415534659154 | 2.375 | -2.37 | 0.01 | -0.157 | 0.156 |
| 4.649557127312744 | 2.364 | -2.359 | 0.009 | -0.148 | 0.148 |
| 4.652698719966334 | 2.353 | -2.349 | 0.008 | -0.14 | 0.14 |
| 4.655840312619923 | 2.342 | -2.338 | 0.007 | -0.132 | 0.132 |
| 4.658981905273513 | 2.331 | -2.328 | 0.007 | -0.124 | 0.124 |
| 4.662123497927102 | 2.32 | -2.317 | 0.006 | -0.117 | 0.116 |
| 4.665265090580692 | 2.309 | -2.307 | 0.005 | -0.109 | 0.109 |
| 4.668406683234282 | 2.298 | -2.296 | 0.004 | -0.101 | 0.101 |
| 4.671548275887871 | 2.288 | -2.286 | 0.004 | -0.093 | 0.093 |
| 4.674689868541461 | 2.277 | -2.275 | 0.003 | -0.086 | 0.086 |
| 4.67783146119505 | 2.266 | -2.265 | 0.003 | -0.078 | 0.078 |
| 4.68097305384864 | 2.255 | -2.254 | 0.002 | -0.071 | 0.071 |
| 4.68411464650223 | 2.245 | -2.244 | 0.002 | -0.063 | 0.063 |
| 4.687256239155819 | 2.234 | -2.234 | 0.001 | -0.056 | 0.056 |
| 4.690397831809409 | 2.224 | -2.223 | 0.001 | -0.049 | 0.049 |
| 4.693539424462998 | 2.213 | -2.213 | 0.001 | -0.042 | 0.042 |
| 4.696681017116588 | 2.203 | -2.203 | 0.001 | -0.035 | 0.035 |
| 4.699822609770177 | 2.193 | -2.192 | 0 | -0.028 | 0.028 |
| 4.702964202423767 | 2.182 | -2.182 | 0 | -0.021 | 0.021 |
| 4.706105795077356 | 2.172 | -2.172 | 0 | -0.014 | 0.014 |
| 4.709247387730946 | 2.162 | -2.162 | 0 | -0.007 | 0.007 |
| 4.712388980384535 | 2.152 | -2.152 | 0 | 0 | 0 |
| 4.715530573038126 | 2.142 | -2.142 | 0 | 0.007 | -0.007 |
| 4.718672165691715 | 2.131 | -2.131 | 0 | 0.013 | -0.013 |
| 4.721813758345305 | 2.121 | -2.121 | 0 | 0.02 | -0.02 |
| 4.724955350998894 | 2.111 | -2.111 | 0 | 0.027 | -0.027 |
| 4.728096943652484 | 2.102 | -2.101 | 0.001 | 0.033 | -0.033 |
| 4.731238536306074 | 2.092 | -2.091 | 0.001 | 0.039 | -0.039 |
| 4.734380128959663 | 2.082 | -2.081 | 0.001 | 0.046 | -0.046 |
| 4.737521721613253 | 2.072 | -2.071 | 0.001 | 0.052 | -0.052 |
| 4.740663314266842 | 2.062 | -2.062 | 0.002 | 0.058 | -0.058 |
| 4.743804906920432 | 2.053 | -2.052 | 0.002 | 0.064 | -0.064 |
| 4.74694649957402 | 2.043 | -2.042 | 0.002 | 0.071 | -0.071 |
| 4.750088092227611 | 2.033 | -2.032 | 0.003 | 0.077 | -0.077 |
| 4.7532296848812 | 2.024 | -2.022 | 0.003 | 0.083 | -0.083 |
| 4.75637127753479 | 2.014 | -2.012 | 0.004 | 0.089 | -0.088 |
| 4.75951287018838 | 2.005 | -2.003 | 0.004 | 0.094 | -0.094 |
| 4.76265446284197 | 1.996 | -1.993 | 0.005 | 0.1 | -0.1 |
| 4.765796055495559 | 1.986 | -1.983 | 0.006 | 0.106 | -0.106 |
| 4.768937648149149 | 1.977 | -1.974 | 0.006 | 0.112 | -0.112 |
| 4.772079240802738 | 1.968 | -1.964 | 0.007 | 0.117 | -0.117 |
| 4.775220833456327 | 1.958 | -1.954 | 0.008 | 0.123 | -0.123 |
| 4.778362426109917 | 1.949 | -1.945 | 0.008 | 0.129 | -0.128 |
| 4.781504018763507 | 1.94 | -1.935 | 0.009 | 0.134 | -0.134 |
| 4.784645611417097 | 1.931 | -1.926 | 0.01 | 0.139 | -0.139 |
| 4.787787204070686 | 1.922 | -1.916 | 0.011 | 0.145 | -0.144 |
| 4.790928796724275 | 1.913 | -1.907 | 0.012 | 0.15 | -0.15 |
| 4.794070389377865 | 1.904 | -1.898 | 0.013 | 0.155 | -0.155 |
| 4.797211982031455 | 1.895 | -1.888 | 0.014 | 0.161 | -0.16 |
| 4.800353574685045 | 1.886 | -1.879 | 0.015 | 0.166 | -0.165 |
| 4.803495167338634 | 1.877 | -1.87 | 0.016 | 0.171 | -0.17 |
| 4.806636759992224 | 1.869 | -1.86 | 0.017 | 0.176 | -0.175 |
| 4.809778352645814 | 1.86 | -1.851 | 0.018 | 0.181 | -0.18 |
| 4.812919945299403 | 1.851 | -1.842 | 0.019 | 0.186 | -0.185 |
| 4.816061537952993 | 1.843 | -1.833 | 0.02 | 0.191 | -0.19 |
| 4.819203130606582 | 1.834 | -1.824 | 0.021 | 0.196 | -0.194 |
| 4.822344723260172 | 1.826 | -1.815 | 0.022 | 0.2 | -0.199 |
| 4.825486315913761 | 1.817 | -1.806 | 0.023 | 0.205 | -0.204 |
| 4.828627908567351 | 1.809 | -1.796 | 0.024 | 0.21 | -0.208 |
| 4.83176950122094 | 1.8 | -1.787 | 0.026 | 0.214 | -0.213 |
| 4.83491109387453 | 1.792 | -1.778 | 0.027 | 0.219 | -0.217 |
| 4.83805268652812 | 1.784 | -1.77 | 0.028 | 0.224 | -0.222 |
| 4.841194279181709 | 1.775 | -1.761 | 0.029 | 0.228 | -0.226 |
| 4.844335871835299 | 1.767 | -1.752 | 0.031 | 0.232 | -0.23 |
| 4.847477464488889 | 1.759 | -1.743 | 0.032 | 0.237 | -0.235 |
| 4.850619057142478 | 1.751 | -1.734 | 0.033 | 0.241 | -0.239 |
| 4.853760649796068 | 1.743 | -1.725 | 0.035 | 0.246 | -0.243 |
| 4.856902242449657 | 1.735 | -1.717 | 0.036 | 0.25 | -0.247 |
| 4.860043835103247 | 1.727 | -1.708 | 0.037 | 0.254 | -0.251 |
| 4.863185427756837 | 1.719 | -1.699 | 0.039 | 0.258 | -0.255 |
| 4.866327020410426 | 1.711 | -1.691 | 0.04 | 0.262 | -0.259 |
| 4.869468613064015 | 1.703 | -1.682 | 0.042 | 0.266 | -0.263 |
| 4.872610205717605 | 1.695 | -1.673 | 0.043 | 0.27 | -0.267 |
| 4.875751798371195 | 1.687 | -1.665 | 0.045 | 0.274 | -0.271 |
| 4.878893391024784 | 1.68 | -1.656 | 0.046 | 0.278 | -0.275 |
| 4.882034983678374 | 1.672 | -1.648 | 0.048 | 0.282 | -0.278 |
| 4.885176576331964 | 1.664 | -1.639 | 0.049 | 0.286 | -0.282 |
| 4.888318168985553 | 1.657 | -1.631 | 0.051 | 0.29 | -0.285 |
| 4.891459761639143 | 1.649 | -1.623 | 0.052 | 0.294 | -0.289 |
| 4.894601354292733 | 1.641 | -1.614 | 0.054 | 0.297 | -0.293 |
| 4.897742946946322 | 1.634 | -1.606 | 0.055 | 0.301 | -0.296 |
| 4.900884539599912 | 1.626 | -1.598 | 0.057 | 0.305 | -0.299 |
| 4.904026132253501 | 1.619 | -1.589 | 0.059 | 0.308 | -0.303 |
| 4.907167724907091 | 1.612 | -1.581 | 0.06 | 0.312 | -0.306 |
| 4.91030931756068 | 1.604 | -1.573 | 0.062 | 0.315 | -0.309 |
| 4.91345091021427 | 1.597 | -1.565 | 0.064 | 0.319 | -0.313 |
| 4.91659250286786 | 1.59 | -1.557 | 0.065 | 0.322 | -0.316 |
| 4.91973409552145 | 1.583 | -1.549 | 0.067 | 0.326 | -0.319 |
| 4.922875688175039 | 1.575 | -1.541 | 0.069 | 0.329 | -0.322 |
| 4.926017280828628 | 1.568 | -1.533 | 0.07 | 0.332 | -0.325 |
| 4.929158873482218 | 1.561 | -1.525 | 0.072 | 0.336 | -0.328 |
| 4.932300466135808 | 1.554 | -1.517 | 0.074 | 0.339 | -0.331 |
| 4.935442058789397 | 1.547 | -1.509 | 0.076 | 0.342 | -0.334 |
| 4.938583651442987 | 1.54 | -1.501 | 0.077 | 0.345 | -0.337 |
| 4.941725244096576 | 1.533 | -1.493 | 0.079 | 0.349 | -0.339 |
| 4.944866836750166 | 1.526 | -1.485 | 0.081 | 0.352 | -0.342 |
| 4.948008429403755 | 1.519 | -1.477 | 0.083 | 0.355 | -0.345 |
| 4.951150022057345 | 1.513 | -1.47 | 0.085 | 0.358 | -0.348 |
| 4.954291614710935 | 1.506 | -1.462 | 0.086 | 0.361 | -0.35 |
| 4.957433207364524 | 1.499 | -1.454 | 0.088 | 0.364 | -0.353 |
| 4.960574800018114 | 1.492 | -1.447 | 0.09 | 0.367 | -0.355 |
| 4.963716392671704 | 1.486 | -1.439 | 0.092 | 0.369 | -0.358 |
| 4.966857985325293 | 1.479 | -1.431 | 0.094 | 0.372 | -0.36 |
| 4.969999577978883 | 1.472 | -1.424 | 0.096 | 0.375 | -0.363 |
| 4.973141170632472 | 1.466 | -1.416 | 0.097 | 0.378 | -0.365 |
| 4.976282763286062 | 1.459 | -1.409 | 0.099 | 0.381 | -0.367 |
| 4.979424355939651 | 1.453 | -1.401 | 0.101 | 0.383 | -0.37 |
| 4.982565948593241 | 1.446 | -1.394 | 0.103 | 0.386 | -0.372 |
| 4.985707541246831 | 1.44 | -1.386 | 0.105 | 0.389 | -0.374 |
| 4.98884913390042 | 1.434 | -1.379 | 0.107 | 0.391 | -0.376 |
| 4.99199072655401 | 1.427 | -1.372 | 0.109 | 0.394 | -0.379 |
| 4.9951323192076 | 1.421 | -1.364 | 0.111 | 0.396 | -0.381 |
| 4.99827391186119 | 1.415 | -1.357 | 0.112 | 0.399 | -0.383 |
| 5.00141550451478 | 1.408 | -1.35 | 0.114 | 0.401 | -0.385 |
| 5.004557097168369 | 1.402 | -1.343 | 0.116 | 0.404 | -0.387 |
| 5.007698689821958 | 1.396 | -1.336 | 0.118 | 0.406 | -0.389 |
| 5.010840282475548 | 1.39 | -1.328 | 0.12 | 0.409 | -0.391 |
| 5.013981875129137 | 1.384 | -1.321 | 0.122 | 0.411 | -0.392 |
| 5.017123467782727 | 1.378 | -1.314 | 0.124 | 0.413 | -0.394 |
| 5.020265060436317 | 1.372 | -1.307 | 0.126 | 0.416 | -0.396 |
| 5.023406653089906 | 1.366 | -1.3 | 0.128 | 0.418 | -0.398 |
| 5.026548245743496 | 1.36 | -1.293 | 0.13 | 0.42 | -0.4 |
| 5.029689838397085 | 1.354 | -1.286 | 0.132 | 0.422 | -0.401 |
| 5.032831431050674 | 1.348 | -1.279 | 0.134 | 0.425 | -0.403 |
| 5.035973023704264 | 1.342 | -1.272 | 0.136 | 0.427 | -0.405 |
| 5.039114616357854 | 1.336 | -1.265 | 0.138 | 0.429 | -0.406 |
| 5.042256209011444 | 1.33 | -1.259 | 0.14 | 0.431 | -0.408 |
| 5.045397801665033 | 1.325 | -1.252 | 0.142 | 0.433 | -0.409 |
| 5.048539394318622 | 1.319 | -1.245 | 0.144 | 0.435 | -0.411 |
| 5.051680986972213 | 1.313 | -1.238 | 0.145 | 0.437 | -0.412 |
| 5.054822579625802 | 1.308 | -1.232 | 0.147 | 0.439 | -0.414 |
| 5.057964172279392 | 1.302 | -1.225 | 0.149 | 0.441 | -0.415 |
| 5.061105764932981 | 1.296 | -1.218 | 0.151 | 0.443 | -0.416 |
| 5.064247357586571 | 1.291 | -1.212 | 0.153 | 0.445 | -0.418 |
| 5.067388950240161 | 1.285 | -1.205 | 0.155 | 0.447 | -0.419 |
| 5.07053054289375 | 1.28 | -1.198 | 0.157 | 0.449 | -0.42 |
| 5.07367213554734 | 1.274 | -1.192 | 0.159 | 0.45 | -0.421 |
| 5.07681372820093 | 1.269 | -1.185 | 0.161 | 0.452 | -0.423 |
| 5.079955320854519 | 1.263 | -1.179 | 0.163 | 0.454 | -0.424 |
| 5.083096913508108 | 1.258 | -1.173 | 0.165 | 0.456 | -0.425 |
| 5.086238506161698 | 1.253 | -1.166 | 0.167 | 0.457 | -0.426 |
| 5.089380098815288 | 1.247 | -1.16 | 0.169 | 0.459 | -0.427 |
| 5.092521691468877 | 1.242 | -1.153 | 0.171 | 0.461 | -0.428 |
| 5.095663284122466 | 1.237 | -1.147 | 0.173 | 0.463 | -0.429 |
| 5.098804876776057 | 1.232 | -1.141 | 0.175 | 0.464 | -0.43 |
| 5.101946469429646 | 1.226 | -1.134 | 0.177 | 0.466 | -0.431 |
| 5.105088062083236 | 1.221 | -1.128 | 0.179 | 0.467 | -0.432 |
| 5.108229654736825 | 1.216 | -1.122 | 0.181 | 0.469 | -0.433 |
| 5.111371247390415 | 1.211 | -1.116 | 0.183 | 0.47 | -0.433 |
| 5.114512840044005 | 1.206 | -1.11 | 0.185 | 0.472 | -0.434 |
| 5.117654432697594 | 1.201 | -1.104 | 0.187 | 0.473 | -0.435 |
| 5.120796025351184 | 1.196 | -1.097 | 0.189 | 0.475 | -0.436 |
| 5.123937618004773 | 1.191 | -1.091 | 0.191 | 0.476 | -0.437 |
| 5.127079210658363 | 1.186 | -1.085 | 0.192 | 0.478 | -0.437 |
| 5.130220803311953 | 1.181 | -1.079 | 0.194 | 0.479 | -0.438 |
| 5.133362395965542 | 1.176 | -1.073 | 0.196 | 0.481 | -0.439 |
| 5.136503988619131 | 1.171 | -1.067 | 0.198 | 0.482 | -0.439 |
| 5.13964558127272 | 1.166 | -1.061 | 0.2 | 0.483 | -0.44 |
| 5.142787173926311 | 1.161 | -1.055 | 0.202 | 0.485 | -0.44 |
| 5.1459287665799 | 1.157 | -1.05 | 0.204 | 0.486 | -0.441 |
| 5.14907035923349 | 1.152 | -1.044 | 0.206 | 0.487 | -0.441 |
| 5.15221195188708 | 1.147 | -1.038 | 0.208 | 0.488 | -0.442 |
| 5.15535354454067 | 1.142 | -1.032 | 0.21 | 0.49 | -0.442 |
| 5.158495137194259 | 1.138 | -1.026 | 0.212 | 0.491 | -0.443 |
| 5.161636729847848 | 1.133 | -1.021 | 0.214 | 0.492 | -0.443 |
| 5.164778322501438 | 1.128 | -1.015 | 0.216 | 0.493 | -0.444 |
| 5.167919915155028 | 1.124 | -1.009 | 0.218 | 0.494 | -0.444 |
| 5.171061507808617 | 1.119 | -1.004 | 0.219 | 0.496 | -0.444 |
| 5.174203100462206 | 1.115 | -0.998 | 0.221 | 0.497 | -0.445 |
| 5.177344693115796 | 1.11 | -0.992 | 0.223 | 0.498 | -0.445 |
| 5.180486285769386 | 1.106 | -0.987 | 0.225 | 0.499 | -0.445 |
| 5.183627878422976 | 1.101 | -0.981 | 0.227 | 0.5 | -0.445 |
| 5.186769471076565 | 1.097 | -0.976 | 0.229 | 0.501 | -0.446 |
| 5.189911063730155 | 1.092 | -0.97 | 0.231 | 0.502 | -0.446 |
| 5.193052656383744 | 1.088 | -0.965 | 0.233 | 0.503 | -0.446 |
| 5.196194249037334 | 1.083 | -0.959 | 0.234 | 0.504 | -0.446 |
| 5.199335841690924 | 1.079 | -0.954 | 0.236 | 0.505 | -0.446 |
| 5.202477434344513 | 1.075 | -0.948 | 0.238 | 0.506 | -0.446 |
| 5.205619026998103 | 1.07 | -0.943 | 0.24 | 0.507 | -0.446 |
| 5.208760619651692 | 1.066 | -0.938 | 0.242 | 0.508 | -0.446 |
| 5.211902212305282 | 1.062 | -0.932 | 0.244 | 0.509 | -0.447 |
| 5.215043804958871 | 1.058 | -0.927 | 0.245 | 0.51 | -0.447 |
| 5.218185397612461 | 1.054 | -0.922 | 0.247 | 0.51 | -0.447 |
| 5.221326990266051 | 1.049 | -0.916 | 0.249 | 0.511 | -0.446 |
| 5.22446858291964 | 1.045 | -0.911 | 0.251 | 0.512 | -0.446 |
| 5.22761017557323 | 1.041 | -0.906 | 0.253 | 0.513 | -0.446 |
| 5.23075176822682 | 1.037 | -0.901 | 0.255 | 0.514 | -0.446 |
| 5.23389336088041 | 1.033 | -0.896 | 0.256 | 0.515 | -0.446 |
| 5.237034953533999 | 1.029 | -0.89 | 0.258 | 0.515 | -0.446 |
| 5.240176546187588 | 1.025 | -0.885 | 0.26 | 0.516 | -0.446 |
| 5.243318138841178 | 1.021 | -0.88 | 0.262 | 0.517 | -0.446 |
| 5.246459731494767 | 1.017 | -0.875 | 0.263 | 0.518 | -0.445 |
| 5.249601324148357 | 1.013 | -0.87 | 0.265 | 0.518 | -0.445 |
| 5.252742916801947 | 1.009 | -0.865 | 0.267 | 0.519 | -0.445 |
| 5.255884509455536 | 1.005 | -0.86 | 0.269 | 0.52 | -0.445 |
| 5.259026102109125 | 1.001 | -0.855 | 0.27 | 0.52 | -0.445 |
| 5.262167694762715 | 0.997 | -0.85 | 0.272 | 0.521 | -0.444 |
| 5.265309287416305 | 0.993 | -0.845 | 0.274 | 0.522 | -0.444 |
| 5.268450880069895 | 0.989 | -0.84 | 0.276 | 0.522 | -0.444 |
| 5.271592472723484 | 0.986 | -0.835 | 0.277 | 0.523 | -0.443 |
| 5.274734065377074 | 0.982 | -0.831 | 0.279 | 0.523 | -0.443 |
| 5.277875658030664 | 0.978 | -0.826 | 0.281 | 0.524 | -0.442 |
| 5.281017250684253 | 0.974 | -0.821 | 0.283 | 0.525 | -0.442 |
| 5.284158843337843 | 0.971 | -0.816 | 0.284 | 0.525 | -0.442 |
| 5.287300435991432 | 0.967 | -0.811 | 0.286 | 0.526 | -0.441 |
| 5.290442028645022 | 0.963 | -0.807 | 0.288 | 0.526 | -0.441 |
| 5.293583621298612 | 0.96 | -0.802 | 0.289 | 0.527 | -0.44 |
| 5.296725213952201 | 0.956 | -0.797 | 0.291 | 0.527 | -0.44 |
| 5.299866806605791 | 0.952 | -0.793 | 0.293 | 0.528 | -0.439 |
| 5.30300839925938 | 0.949 | -0.788 | 0.294 | 0.528 | -0.439 |
| 5.30614999191297 | 0.945 | -0.783 | 0.296 | 0.529 | -0.438 |
| 5.30929158456656 | 0.942 | -0.779 | 0.297 | 0.529 | -0.438 |
| 5.312433177220149 | 0.938 | -0.774 | 0.299 | 0.53 | -0.437 |
| 5.315574769873739 | 0.934 | -0.77 | 0.301 | 0.53 | -0.437 |
| 5.318716362527328 | 0.931 | -0.765 | 0.302 | 0.53 | -0.436 |
| 5.321857955180918 | 0.927 | -0.76 | 0.304 | 0.531 | -0.435 |
| 5.324999547834508 | 0.924 | -0.756 | 0.306 | 0.531 | -0.435 |
| 5.328141140488097 | 0.921 | -0.751 | 0.307 | 0.532 | -0.434 |
| 5.331282733141686 | 0.917 | -0.747 | 0.309 | 0.532 | -0.433 |
| 5.334424325795276 | 0.914 | -0.743 | 0.31 | 0.532 | -0.433 |
| 5.337565918448866 | 0.91 | -0.738 | 0.312 | 0.533 | -0.432 |
| 5.340707511102456 | 0.907 | -0.734 | 0.313 | 0.533 | -0.431 |
| 5.343849103756045 | 0.904 | -0.729 | 0.315 | 0.533 | -0.431 |
| 5.346990696409634 | 0.9 | -0.725 | 0.316 | 0.534 | -0.43 |
| 5.350132289063224 | 0.897 | -0.721 | 0.318 | 0.534 | -0.429 |
| 5.353273881716814 | 0.894 | -0.716 | 0.319 | 0.534 | -0.428 |
| 5.356415474370403 | 0.89 | -0.712 | 0.321 | 0.535 | -0.428 |
| 5.359557067023993 | 0.887 | -0.708 | 0.323 | 0.535 | -0.427 |
| 5.362698659677583 | 0.884 | -0.704 | 0.324 | 0.535 | -0.426 |
| 5.365840252331172 | 0.881 | -0.699 | 0.325 | 0.535 | -0.425 |
| 5.368981844984762 | 0.878 | -0.695 | 0.327 | 0.536 | -0.424 |
| 5.372123437638351 | 0.874 | -0.691 | 0.328 | 0.536 | -0.423 |
| 5.375265030291941 | 0.871 | -0.687 | 0.33 | 0.536 | -0.423 |
| 5.378406622945531 | 0.868 | -0.683 | 0.331 | 0.536 | -0.422 |
| 5.38154821559912 | 0.865 | -0.678 | 0.333 | 0.537 | -0.421 |
| 5.38468980825271 | 0.862 | -0.674 | 0.334 | 0.537 | -0.42 |
| 5.387831400906299 | 0.859 | -0.67 | 0.336 | 0.537 | -0.419 |
| 5.39097299355989 | 0.856 | -0.666 | 0.337 | 0.537 | -0.418 |
| 5.394114586213479 | 0.853 | -0.662 | 0.339 | 0.537 | -0.417 |
| 5.397256178867068 | 0.85 | -0.658 | 0.34 | 0.537 | -0.416 |
| 5.400397771520657 | 0.847 | -0.654 | 0.341 | 0.538 | -0.415 |
| 5.403539364174247 | 0.844 | -0.65 | 0.343 | 0.538 | -0.414 |
| 5.406680956827837 | 0.841 | -0.646 | 0.344 | 0.538 | -0.413 |
| 5.409822549481426 | 0.838 | -0.642 | 0.345 | 0.538 | -0.412 |
| 5.412964142135016 | 0.835 | -0.638 | 0.347 | 0.538 | -0.411 |
| 5.416105734788605 | 0.832 | -0.634 | 0.348 | 0.538 | -0.41 |
| 5.419247327442195 | 0.829 | -0.63 | 0.35 | 0.538 | -0.409 |
| 5.422388920095785 | 0.826 | -0.626 | 0.351 | 0.538 | -0.408 |
| 5.425530512749375 | 0.823 | -0.622 | 0.352 | 0.538 | -0.407 |
| 5.428672105402964 | 0.82 | -0.619 | 0.354 | 0.538 | -0.406 |
| 5.431813698056554 | 0.817 | -0.615 | 0.355 | 0.538 | -0.405 |
| 5.434955290710143 | 0.814 | -0.611 | 0.356 | 0.539 | -0.404 |
| 5.438096883363733 | 0.812 | -0.607 | 0.357 | 0.539 | -0.403 |
| 5.441238476017322 | 0.809 | -0.603 | 0.359 | 0.539 | -0.402 |
| 5.444380068670912 | 0.806 | -0.599 | 0.36 | 0.539 | -0.401 |
| 5.447521661324502 | 0.803 | -0.596 | 0.361 | 0.539 | -0.4 |
| 5.450663253978091 | 0.8 | -0.592 | 0.363 | 0.539 | -0.398 |
| 5.453804846631681 | 0.798 | -0.588 | 0.364 | 0.539 | -0.397 |
| 5.456946439285271 | 0.795 | -0.585 | 0.365 | 0.539 | -0.396 |
| 5.46008803193886 | 0.792 | -0.581 | 0.366 | 0.539 | -0.395 |
| 5.46322962459245 | 0.789 | -0.577 | 0.367 | 0.539 | -0.394 |
| 5.466371217246039 | 0.787 | -0.574 | 0.369 | 0.539 | -0.393 |
| 5.46951280989963 | 0.784 | -0.57 | 0.37 | 0.539 | -0.391 |
| 5.472654402553218 | 0.781 | -0.566 | 0.371 | 0.539 | -0.39 |
| 5.475795995206808 | 0.779 | -0.563 | 0.372 | 0.538 | -0.389 |
| 5.478937587860398 | 0.776 | -0.559 | 0.373 | 0.538 | -0.388 |
| 5.482079180513987 | 0.774 | -0.556 | 0.375 | 0.538 | -0.387 |
| 5.485220773167577 | 0.771 | -0.552 | 0.376 | 0.538 | -0.385 |
| 5.488362365821166 | 0.768 | -0.548 | 0.377 | 0.538 | -0.384 |
| 5.491503958474756 | 0.766 | -0.545 | 0.378 | 0.538 | -0.383 |
| 5.494645551128346 | 0.763 | -0.541 | 0.379 | 0.538 | -0.382 |
| 5.497787143781935 | 0.761 | -0.538 | 0.38 | 0.538 | -0.38 |
| 5.500928736435525 | 0.758 | -0.534 | 0.381 | 0.538 | -0.379 |
| 5.504070329089115 | 0.756 | -0.531 | 0.383 | 0.538 | -0.378 |
| 5.507211921742704 | 0.753 | -0.528 | 0.384 | 0.538 | -0.377 |
| 5.510353514396294 | 0.751 | -0.524 | 0.385 | 0.537 | -0.375 |
| 5.513495107049883 | 0.748 | -0.521 | 0.386 | 0.537 | -0.374 |
| 5.516636699703473 | 0.746 | -0.517 | 0.387 | 0.537 | -0.373 |
| 5.519778292357062 | 0.743 | -0.514 | 0.388 | 0.537 | -0.371 |
| 5.522919885010652 | 0.741 | -0.511 | 0.389 | 0.537 | -0.37 |
| 5.526061477664242 | 0.738 | -0.507 | 0.39 | 0.537 | -0.369 |
| 5.529203070317831 | 0.736 | -0.504 | 0.391 | 0.537 | -0.367 |
| 5.532344662971421 | 0.734 | -0.501 | 0.392 | 0.536 | -0.366 |
| 5.535486255625011 | 0.731 | -0.497 | 0.393 | 0.536 | -0.365 |
| 5.5386278482786 | 0.729 | -0.494 | 0.394 | 0.536 | -0.363 |
| 5.54176944093219 | 0.727 | -0.491 | 0.395 | 0.536 | -0.362 |
| 5.544911033585779 | 0.724 | -0.487 | 0.396 | 0.536 | -0.361 |
| 5.54805262623937 | 0.722 | -0.484 | 0.397 | 0.535 | -0.359 |
| 5.551194218892959 | 0.72 | -0.481 | 0.398 | 0.535 | -0.358 |
| 5.554335811546548 | 0.717 | -0.478 | 0.399 | 0.535 | -0.356 |
| 5.557477404200137 | 0.715 | -0.475 | 0.4 | 0.535 | -0.355 |
| 5.560618996853727 | 0.713 | -0.471 | 0.401 | 0.535 | -0.354 |
| 5.563760589507317 | 0.71 | -0.468 | 0.402 | 0.534 | -0.352 |
| 5.566902182160906 | 0.708 | -0.465 | 0.403 | 0.534 | -0.351 |
| 5.570043774814496 | 0.706 | -0.462 | 0.404 | 0.534 | -0.349 |
| 5.573185367468086 | 0.704 | -0.459 | 0.405 | 0.534 | -0.348 |
| 5.576326960121675 | 0.702 | -0.456 | 0.406 | 0.533 | -0.346 |
| 5.579468552775264 | 0.699 | -0.453 | 0.407 | 0.533 | -0.345 |
| 5.582610145428854 | 0.697 | -0.449 | 0.407 | 0.533 | -0.344 |
| 5.585751738082444 | 0.695 | -0.446 | 0.408 | 0.533 | -0.342 |
| 5.588893330736034 | 0.693 | -0.443 | 0.409 | 0.532 | -0.341 |
| 5.592034923389623 | 0.691 | -0.44 | 0.41 | 0.532 | -0.339 |
| 5.595176516043213 | 0.689 | -0.437 | 0.411 | 0.532 | -0.338 |
| 5.598318108696803 | 0.686 | -0.434 | 0.412 | 0.532 | -0.336 |
| 5.601459701350392 | 0.684 | -0.431 | 0.413 | 0.531 | -0.335 |
| 5.604601294003982 | 0.682 | -0.428 | 0.413 | 0.531 | -0.333 |
| 5.607742886657571 | 0.68 | -0.425 | 0.414 | 0.531 | -0.332 |
| 5.610884479311161 | 0.678 | -0.422 | 0.415 | 0.53 | -0.33 |
| 5.61402607196475 | 0.676 | -0.419 | 0.416 | 0.53 | -0.329 |
| 5.61716766461834 | 0.674 | -0.416 | 0.417 | 0.53 | -0.327 |
| 5.62030925727193 | 0.672 | -0.413 | 0.417 | 0.53 | -0.326 |
| 5.623450849925519 | 0.67 | -0.41 | 0.418 | 0.529 | -0.324 |
| 5.626592442579109 | 0.668 | -0.408 | 0.419 | 0.529 | -0.323 |
| 5.629734035232698 | 0.666 | -0.405 | 0.42 | 0.529 | -0.321 |
| 5.632875627886288 | 0.664 | -0.402 | 0.42 | 0.528 | -0.32 |
| 5.636017220539878 | 0.662 | -0.399 | 0.421 | 0.528 | -0.318 |
| 5.639158813193467 | 0.66 | -0.396 | 0.422 | 0.528 | -0.317 |
| 5.642300405847057 | 0.658 | -0.393 | 0.423 | 0.527 | -0.315 |
| 5.645441998500646 | 0.656 | -0.39 | 0.423 | 0.527 | -0.314 |
| 5.648583591154236 | 0.654 | -0.388 | 0.424 | 0.527 | -0.312 |
| 5.651725183807825 | 0.652 | -0.385 | 0.425 | 0.526 | -0.311 |
| 5.654866776461415 | 0.65 | -0.382 | 0.425 | 0.526 | -0.309 |
| 5.658008369115005 | 0.648 | -0.379 | 0.426 | 0.525 | -0.308 |
| 5.661149961768594 | 0.646 | -0.376 | 0.427 | 0.525 | -0.306 |
| 5.664291554422184 | 0.644 | -0.374 | 0.427 | 0.525 | -0.304 |
| 5.667433147075774 | 0.642 | -0.371 | 0.428 | 0.524 | -0.303 |
| 5.670574739729363 | 0.64 | -0.368 | 0.429 | 0.524 | -0.301 |
| 5.673716332382953 | 0.639 | -0.366 | 0.429 | 0.524 | -0.3 |
| 5.676857925036542 | 0.637 | -0.363 | 0.43 | 0.523 | -0.298 |
| 5.679999517690132 | 0.635 | -0.36 | 0.431 | 0.523 | -0.297 |
| 5.683141110343721 | 0.633 | -0.357 | 0.431 | 0.522 | -0.295 |
| 5.686282702997311 | 0.631 | -0.355 | 0.432 | 0.522 | -0.293 |
| 5.689424295650901 | 0.629 | -0.352 | 0.432 | 0.522 | -0.292 |
| 5.69256588830449 | 0.628 | -0.349 | 0.433 | 0.521 | -0.29 |
| 5.69570748095808 | 0.626 | -0.347 | 0.434 | 0.521 | -0.289 |
| 5.69884907361167 | 0.624 | -0.344 | 0.434 | 0.52 | -0.287 |
| 5.701990666265259 | 0.622 | -0.342 | 0.435 | 0.52 | -0.286 |
| 5.705132258918849 | 0.62 | -0.339 | 0.435 | 0.52 | -0.284 |
| 5.708273851572438 | 0.619 | -0.336 | 0.436 | 0.519 | -0.282 |
| 5.711415444226028 | 0.617 | -0.334 | 0.436 | 0.519 | -0.281 |
| 5.714557036879618 | 0.615 | -0.331 | 0.437 | 0.518 | -0.279 |
| 5.717698629533207 | 0.613 | -0.329 | 0.437 | 0.518 | -0.278 |
| 5.720840222186797 | 0.612 | -0.326 | 0.438 | 0.518 | -0.276 |
| 5.723981814840386 | 0.61 | -0.324 | 0.438 | 0.517 | -0.274 |
| 5.727123407493976 | 0.608 | -0.321 | 0.439 | 0.517 | -0.273 |
| 5.730265000147565 | 0.607 | -0.319 | 0.439 | 0.516 | -0.271 |
| 5.733406592801155 | 0.605 | -0.316 | 0.44 | 0.516 | -0.269 |
| 5.736548185454744 | 0.603 | -0.314 | 0.44 | 0.515 | -0.268 |
| 5.739689778108334 | 0.602 | -0.311 | 0.441 | 0.515 | -0.266 |
| 5.742831370761924 | 0.6 | -0.309 | 0.441 | 0.514 | -0.265 |
| 5.745972963415514 | 0.598 | -0.306 | 0.442 | 0.514 | -0.263 |
| 5.749114556069103 | 0.597 | -0.304 | 0.442 | 0.514 | -0.261 |
| 5.752256148722693 | 0.595 | -0.301 | 0.442 | 0.513 | -0.26 |
| 5.755397741376282 | 0.593 | -0.299 | 0.443 | 0.513 | -0.258 |
| 5.758539334029872 | 0.592 | -0.296 | 0.443 | 0.512 | -0.257 |
| 5.761680926683462 | 0.59 | -0.294 | 0.444 | 0.512 | -0.255 |
| 5.764822519337051 | 0.589 | -0.292 | 0.444 | 0.511 | -0.253 |
| 5.767964111990641 | 0.587 | -0.289 | 0.444 | 0.511 | -0.252 |
| 5.77110570464423 | 0.585 | -0.287 | 0.445 | 0.51 | -0.25 |
| 5.77424729729782 | 0.584 | -0.284 | 0.445 | 0.51 | -0.248 |
| 5.77738888995141 | 0.582 | -0.282 | 0.446 | 0.509 | -0.247 |
| 5.780530482605 | 0.581 | -0.28 | 0.446 | 0.509 | -0.245 |
| 5.783672075258588 | 0.579 | -0.277 | 0.446 | 0.508 | -0.244 |
| 5.786813667912178 | 0.578 | -0.275 | 0.447 | 0.508 | -0.242 |
| 5.789955260565768 | 0.576 | -0.273 | 0.447 | 0.507 | -0.24 |
| 5.793096853219358 | 0.575 | -0.27 | 0.447 | 0.507 | -0.239 |
| 5.796238445872947 | 0.573 | -0.268 | 0.448 | 0.506 | -0.237 |
| 5.799380038526537 | 0.572 | -0.266 | 0.448 | 0.506 | -0.235 |
| 5.802521631180126 | 0.57 | -0.264 | 0.448 | 0.505 | -0.234 |
| 5.805663223833715 | 0.569 | -0.261 | 0.448 | 0.505 | -0.232 |
| 5.808804816487306 | 0.567 | -0.259 | 0.449 | 0.504 | -0.23 |
| 5.811946409140895 | 0.566 | -0.257 | 0.449 | 0.504 | -0.229 |
| 5.815088001794485 | 0.564 | -0.255 | 0.449 | 0.503 | -0.227 |
| 5.818229594448074 | 0.563 | -0.252 | 0.45 | 0.503 | -0.225 |
| 5.821371187101663 | 0.561 | -0.25 | 0.45 | 0.502 | -0.224 |
| 5.824512779755254 | 0.56 | -0.248 | 0.45 | 0.502 | -0.222 |
| 5.827654372408843 | 0.558 | -0.246 | 0.45 | 0.501 | -0.221 |
| 5.830795965062433 | 0.557 | -0.243 | 0.45 | 0.501 | -0.219 |
| 5.833937557716022 | 0.555 | -0.241 | 0.451 | 0.5 | -0.217 |
| 5.837079150369612 | 0.554 | -0.239 | 0.451 | 0.5 | -0.216 |
| 5.840220743023201 | 0.553 | -0.237 | 0.451 | 0.499 | -0.214 |
| 5.843362335676791 | 0.551 | -0.235 | 0.451 | 0.499 | -0.212 |
| 5.846503928330381 | 0.55 | -0.233 | 0.452 | 0.498 | -0.211 |
| 5.84964552098397 | 0.548 | -0.23 | 0.452 | 0.498 | -0.209 |
| 5.85278711363756 | 0.547 | -0.228 | 0.452 | 0.497 | -0.207 |
| 5.85592870629115 | 0.546 | -0.226 | 0.452 | 0.497 | -0.206 |
| 5.85907029894474 | 0.544 | -0.224 | 0.452 | 0.496 | -0.204 |
| 5.862211891598329 | 0.543 | -0.222 | 0.452 | 0.496 | -0.203 |
| 5.865353484251918 | 0.542 | -0.22 | 0.452 | 0.495 | -0.201 |
| 5.868495076905508 | 0.54 | -0.218 | 0.453 | 0.495 | -0.199 |
| 5.871636669559098 | 0.539 | -0.216 | 0.453 | 0.494 | -0.198 |
| 5.874778262212687 | 0.538 | -0.214 | 0.453 | 0.493 | -0.196 |
| 5.877919854866277 | 0.536 | -0.211 | 0.453 | 0.493 | -0.194 |
| 5.881061447519866 | 0.535 | -0.209 | 0.453 | 0.492 | -0.193 |
| 5.884203040173456 | 0.534 | -0.207 | 0.453 | 0.492 | -0.191 |
| 5.887344632827046 | 0.532 | -0.205 | 0.453 | 0.491 | -0.189 |
| 5.890486225480635 | 0.531 | -0.203 | 0.453 | 0.491 | -0.188 |
| 5.893627818134224 | 0.53 | -0.201 | 0.453 | 0.49 | -0.186 |
| 5.896769410787814 | 0.529 | -0.199 | 0.454 | 0.49 | -0.185 |
| 5.899911003441404 | 0.527 | -0.197 | 0.454 | 0.489 | -0.183 |
| 5.903052596094994 | 0.526 | -0.195 | 0.454 | 0.489 | -0.181 |
| 5.906194188748583 | 0.525 | -0.193 | 0.454 | 0.488 | -0.18 |
| 5.909335781402172 | 0.524 | -0.191 | 0.454 | 0.487 | -0.178 |
| 5.912477374055762 | 0.522 | -0.189 | 0.454 | 0.487 | -0.176 |
| 5.915618966709352 | 0.521 | -0.187 | 0.454 | 0.486 | -0.175 |
| 5.918760559362942 | 0.52 | -0.185 | 0.454 | 0.486 | -0.173 |
| 5.921902152016531 | 0.519 | -0.183 | 0.454 | 0.485 | -0.171 |
| 5.92504374467012 | 0.517 | -0.181 | 0.454 | 0.485 | -0.17 |
| 5.92818533732371 | 0.516 | -0.179 | 0.454 | 0.484 | -0.168 |
| 5.9313269299773 | 0.515 | -0.177 | 0.454 | 0.483 | -0.167 |
| 5.93446852263089 | 0.514 | -0.176 | 0.454 | 0.483 | -0.165 |
| 5.93761011528448 | 0.513 | -0.174 | 0.454 | 0.482 | -0.163 |
| 5.940751707938068 | 0.511 | -0.172 | 0.454 | 0.482 | -0.162 |
| 5.943893300591658 | 0.51 | -0.17 | 0.454 | 0.481 | -0.16 |
| 5.947034893245248 | 0.509 | -0.168 | 0.454 | 0.481 | -0.159 |
| 5.950176485898837 | 0.508 | -0.166 | 0.454 | 0.48 | -0.157 |
| 5.953318078552427 | 0.507 | -0.164 | 0.454 | 0.479 | -0.155 |
| 5.956459671206017 | 0.506 | -0.162 | 0.454 | 0.479 | -0.154 |
| 5.959601263859606 | 0.504 | -0.16 | 0.453 | 0.478 | -0.152 |
| 5.962742856513196 | 0.503 | -0.159 | 0.453 | 0.478 | -0.15 |
| 5.965884449166785 | 0.502 | -0.157 | 0.453 | 0.477 | -0.149 |
| 5.969026041820375 | 0.501 | -0.155 | 0.453 | 0.477 | -0.147 |
| 5.972167634473964 | 0.5 | -0.153 | 0.453 | 0.476 | -0.146 |
| 5.975309227127554 | 0.499 | -0.151 | 0.453 | 0.475 | -0.144 |
| 5.978450819781144 | 0.498 | -0.149 | 0.453 | 0.475 | -0.142 |
| 5.981592412434733 | 0.497 | -0.148 | 0.453 | 0.474 | -0.141 |
| 5.984734005088323 | 0.495 | -0.146 | 0.453 | 0.474 | -0.139 |
| 5.987875597741913 | 0.494 | -0.144 | 0.453 | 0.473 | -0.138 |
| 5.991017190395502 | 0.493 | -0.142 | 0.452 | 0.472 | -0.136 |
| 5.994158783049092 | 0.492 | -0.14 | 0.452 | 0.472 | -0.134 |
| 5.997300375702681 | 0.491 | -0.139 | 0.452 | 0.471 | -0.133 |
| 6.000441968356271 | 0.49 | -0.137 | 0.452 | 0.471 | -0.131 |
| 6.003583561009861 | 0.489 | -0.135 | 0.452 | 0.47 | -0.13 |
| 6.00672515366345 | 0.488 | -0.133 | 0.452 | 0.469 | -0.128 |
| 6.00986674631704 | 0.487 | -0.131 | 0.451 | 0.469 | -0.127 |
| 6.01300833897063 | 0.486 | -0.13 | 0.451 | 0.468 | -0.125 |
| 6.01614993162422 | 0.485 | -0.128 | 0.451 | 0.468 | -0.123 |
| 6.019291524277808 | 0.484 | -0.126 | 0.451 | 0.467 | -0.122 |
| 6.022433116931398 | 0.483 | -0.124 | 0.451 | 0.466 | -0.12 |
| 6.025574709584988 | 0.482 | -0.123 | 0.45 | 0.466 | -0.119 |
| 6.028716302238577 | 0.481 | -0.121 | 0.45 | 0.465 | -0.117 |
| 6.031857894892167 | 0.48 | -0.119 | 0.45 | 0.465 | -0.116 |
| 6.034999487545757 | 0.479 | -0.118 | 0.45 | 0.464 | -0.114 |
| 6.038141080199346 | 0.478 | -0.116 | 0.45 | 0.463 | -0.112 |
| 6.041282672852935 | 0.477 | -0.114 | 0.449 | 0.463 | -0.111 |
| 6.044424265506525 | 0.476 | -0.112 | 0.449 | 0.462 | -0.109 |
| 6.047565858160115 | 0.475 | -0.111 | 0.449 | 0.462 | -0.108 |
| 6.050707450813704 | 0.474 | -0.109 | 0.449 | 0.461 | -0.106 |
| 6.053849043467294 | 0.473 | -0.107 | 0.448 | 0.46 | -0.105 |
| 6.056990636120884 | 0.472 | -0.106 | 0.448 | 0.46 | -0.103 |
| 6.060132228774473 | 0.471 | -0.104 | 0.448 | 0.459 | -0.102 |
| 6.063273821428063 | 0.47 | -0.102 | 0.447 | 0.459 | -0.1 |
| 6.066415414081653 | 0.469 | -0.101 | 0.447 | 0.458 | -0.098 |
| 6.069557006735242 | 0.468 | -0.099 | 0.447 | 0.457 | -0.097 |
| 6.072698599388831 | 0.467 | -0.098 | 0.447 | 0.457 | -0.095 |
| 6.07584019204242 | 0.466 | -0.096 | 0.446 | 0.456 | -0.094 |
| 6.078981784696011 | 0.465 | -0.094 | 0.446 | 0.455 | -0.092 |
| 6.082123377349601 | 0.464 | -0.093 | 0.446 | 0.455 | -0.091 |
| 6.08526497000319 | 0.463 | -0.091 | 0.445 | 0.454 | -0.089 |
| 6.08840656265678 | 0.462 | -0.089 | 0.445 | 0.454 | -0.088 |
| 6.09154815531037 | 0.461 | -0.088 | 0.445 | 0.453 | -0.086 |
| 6.094689747963959 | 0.46 | -0.086 | 0.444 | 0.452 | -0.085 |
| 6.097831340617549 | 0.46 | -0.085 | 0.444 | 0.452 | -0.083 |
| 6.100972933271138 | 0.459 | -0.083 | 0.444 | 0.451 | -0.082 |
| 6.104114525924728 | 0.458 | -0.082 | 0.443 | 0.45 | -0.08 |
| 6.107256118578317 | 0.457 | -0.08 | 0.443 | 0.45 | -0.079 |
| 6.110397711231907 | 0.456 | -0.078 | 0.443 | 0.449 | -0.077 |
| 6.113539303885497 | 0.455 | -0.077 | 0.442 | 0.449 | -0.076 |
| 6.116680896539086 | 0.454 | -0.075 | 0.442 | 0.448 | -0.074 |
| 6.119822489192675 | 0.453 | -0.074 | 0.441 | 0.447 | -0.073 |
| 6.122964081846265 | 0.453 | -0.072 | 0.441 | 0.447 | -0.071 |
| 6.126105674499855 | 0.452 | -0.071 | 0.441 | 0.446 | -0.07 |
| 6.129247267153445 | 0.451 | -0.069 | 0.44 | 0.445 | -0.068 |
| 6.132388859807034 | 0.45 | -0.068 | 0.44 | 0.445 | -0.067 |
| 6.135530452460624 | 0.449 | -0.066 | 0.439 | 0.444 | -0.065 |
| 6.138672045114213 | 0.448 | -0.065 | 0.439 | 0.444 | -0.064 |
| 6.141813637767803 | 0.447 | -0.063 | 0.439 | 0.443 | -0.062 |
| 6.144955230421393 | 0.447 | -0.062 | 0.438 | 0.442 | -0.061 |
| 6.148096823074982 | 0.446 | -0.06 | 0.438 | 0.442 | -0.059 |
| 6.151238415728571 | 0.445 | -0.059 | 0.437 | 0.441 | -0.058 |
| 6.154380008382161 | 0.444 | -0.057 | 0.437 | 0.44 | -0.057 |
| 6.157521601035751 | 0.443 | -0.056 | 0.436 | 0.44 | -0.055 |
| 6.16066319368934 | 0.442 | -0.054 | 0.436 | 0.439 | -0.054 |
| 6.16380478634293 | 0.442 | -0.053 | 0.435 | 0.439 | -0.052 |
| 6.16694637899652 | 0.441 | -0.051 | 0.435 | 0.438 | -0.051 |
| 6.170087971650109 | 0.44 | -0.05 | 0.434 | 0.437 | -0.049 |
| 6.173229564303698 | 0.439 | -0.048 | 0.434 | 0.437 | -0.048 |
| 6.176371156957289 | 0.438 | -0.047 | 0.433 | 0.436 | -0.046 |
| 6.179512749610878 | 0.438 | -0.045 | 0.433 | 0.435 | -0.045 |
| 6.182654342264468 | 0.437 | -0.044 | 0.433 | 0.435 | -0.044 |
| 6.185795934918057 | 0.436 | -0.042 | 0.432 | 0.434 | -0.042 |
| 6.188937527571647 | 0.435 | -0.041 | 0.432 | 0.433 | -0.041 |
| 6.192079120225237 | 0.435 | -0.04 | 0.431 | 0.433 | -0.039 |
| 6.195220712878826 | 0.434 | -0.038 | 0.43 | 0.432 | -0.038 |
| 6.198362305532415 | 0.433 | -0.037 | 0.43 | 0.432 | -0.037 |
| 6.201503898186005 | 0.432 | -0.035 | 0.429 | 0.431 | -0.035 |
| 6.204645490839594 | 0.432 | -0.034 | 0.429 | 0.43 | -0.034 |
| 6.207787083493184 | 0.431 | -0.032 | 0.428 | 0.43 | -0.032 |
| 6.210928676146774 | 0.43 | -0.031 | 0.428 | 0.429 | -0.031 |
| 6.214070268800364 | 0.429 | -0.03 | 0.427 | 0.428 | -0.03 |
| 6.217211861453953 | 0.429 | -0.028 | 0.427 | 0.428 | -0.028 |
| 6.220353454107543 | 0.428 | -0.027 | 0.426 | 0.427 | -0.027 |
| 6.223495046761133 | 0.427 | -0.025 | 0.426 | 0.426 | -0.025 |
| 6.226636639414722 | 0.426 | -0.024 | 0.425 | 0.426 | -0.024 |
| 6.229778232068312 | 0.426 | -0.023 | 0.424 | 0.425 | -0.023 |
| 6.232919824721901 | 0.425 | -0.021 | 0.424 | 0.424 | -0.021 |
| 6.236061417375491 | 0.424 | -0.02 | 0.423 | 0.424 | -0.02 |
| 6.23920301002908 | 0.424 | -0.019 | 0.423 | 0.423 | -0.019 |
| 6.24234460268267 | 0.423 | -0.017 | 0.422 | 0.423 | -0.017 |
| 6.24548619533626 | 0.422 | -0.016 | 0.422 | 0.422 | -0.016 |
| 6.24862778798985 | 0.421 | -0.015 | 0.421 | 0.421 | -0.015 |
| 6.251769380643438 | 0.421 | -0.013 | 0.42 | 0.421 | -0.013 |
| 6.254910973297028 | 0.42 | -0.012 | 0.42 | 0.42 | -0.012 |
| 6.258052565950618 | 0.419 | -0.011 | 0.419 | 0.419 | -0.011 |
| 6.261194158604208 | 0.419 | -0.009 | 0.419 | 0.419 | -0.009 |
| 6.264335751257797 | 0.418 | -0.008 | 0.418 | 0.418 | -0.008 |
| 6.267477343911387 | 0.417 | -0.007 | 0.417 | 0.417 | -0.007 |
| 6.270618936564976 | 0.417 | -0.005 | 0.417 | 0.417 | -0.005 |
| 6.273760529218566 | 0.416 | -0.004 | 0.416 | 0.416 | -0.004 |
| 6.276902121872155 | 0.415 | -0.003 | 0.415 | 0.415 | -0.003 |
| 6.280043714525745 | 0.415 | -0.001 | 0.415 | 0.415 | -0.001 |
| 6.283185307179335 | 0.414 | 0 | 0.414 | 0.414 | 0 |